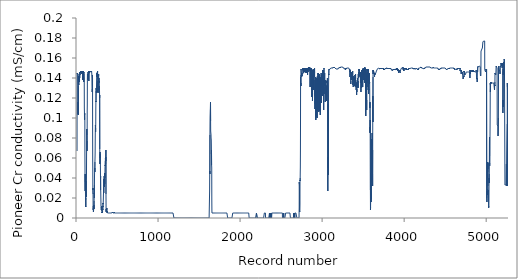
| Category | Series 0 |
|---|---|
| 0.0 | 0.067 |
| 1.0 | 0.145 |
| 2.0 | 0.145 |
| 3.0 | 0.145 |
| 4.0 | 0.144 |
| 5.0 | 0.145 |
| 6.0 | 0.145 |
| 7.0 | 0.145 |
| 8.0 | 0.144 |
| 9.0 | 0.137 |
| 10.0 | 0.134 |
| 11.0 | 0.133 |
| 12.0 | 0.12 |
| 13.0 | 0.104 |
| 14.0 | 0.116 |
| 15.0 | 0.103 |
| 16.0 | 0.132 |
| 17.0 | 0.14 |
| 18.0 | 0.142 |
| 19.0 | 0.142 |
| 20.0 | 0.133 |
| 21.0 | 0.133 |
| 22.0 | 0.133 |
| 23.0 | 0.134 |
| 24.0 | 0.138 |
| 25.0 | 0.139 |
| 26.0 | 0.144 |
| 27.0 | 0.144 |
| 28.0 | 0.136 |
| 29.0 | 0.141 |
| 30.0 | 0.144 |
| 31.0 | 0.143 |
| 32.0 | 0.14 |
| 33.0 | 0.143 |
| 34.0 | 0.145 |
| 35.0 | 0.143 |
| 36.0 | 0.146 |
| 37.0 | 0.145 |
| 38.0 | 0.145 |
| 39.0 | 0.146 |
| 40.0 | 0.146 |
| 41.0 | 0.145 |
| 42.0 | 0.146 |
| 43.0 | 0.146 |
| 44.0 | 0.147 |
| 45.0 | 0.147 |
| 46.0 | 0.147 |
| 47.0 | 0.147 |
| 48.0 | 0.147 |
| 49.0 | 0.147 |
| 50.0 | 0.147 |
| 51.0 | 0.147 |
| 52.0 | 0.146 |
| 53.0 | 0.147 |
| 54.0 | 0.146 |
| 55.0 | 0.147 |
| 56.0 | 0.146 |
| 57.0 | 0.147 |
| 58.0 | 0.147 |
| 59.0 | 0.144 |
| 60.0 | 0.146 |
| 61.0 | 0.145 |
| 62.0 | 0.146 |
| 63.0 | 0.146 |
| 64.0 | 0.146 |
| 65.0 | 0.146 |
| 66.0 | 0.146 |
| 67.0 | 0.145 |
| 68.0 | 0.146 |
| 69.0 | 0.138 |
| 70.0 | 0.146 |
| 71.0 | 0.141 |
| 72.0 | 0.147 |
| 73.0 | 0.138 |
| 74.0 | 0.147 |
| 75.0 | 0.145 |
| 76.0 | 0.146 |
| 77.0 | 0.147 |
| 78.0 | 0.144 |
| 79.0 | 0.142 |
| 80.0 | 0.144 |
| 81.0 | 0.136 |
| 82.0 | 0.146 |
| 83.0 | 0.146 |
| 84.0 | 0.145 |
| 85.0 | 0.143 |
| 86.0 | 0.141 |
| 87.0 | 0.14 |
| 88.0 | 0.135 |
| 89.0 | 0.11 |
| 90.0 | 0.106 |
| 91.0 | 0.098 |
| 92.0 | 0.1 |
| 93.0 | 0.105 |
| 94.0 | 0.103 |
| 95.0 | 0.1 |
| 96.0 | 0.063 |
| 97.0 | 0.05 |
| 98.0 | 0.031 |
| 99.0 | 0.027 |
| 100.0 | 0.044 |
| 101.0 | 0.036 |
| 102.0 | 0.03 |
| 103.0 | 0.024 |
| 104.0 | 0.018 |
| 105.0 | 0.02 |
| 106.0 | 0.011 |
| 107.0 | 0.012 |
| 108.0 | 0.014 |
| 109.0 | 0.032 |
| 110.0 | 0.037 |
| 111.0 | 0.021 |
| 112.0 | 0.026 |
| 113.0 | 0.03 |
| 114.0 | 0.03 |
| 115.0 | 0.04 |
| 116.0 | 0.059 |
| 117.0 | 0.072 |
| 118.0 | 0.086 |
| 119.0 | 0.089 |
| 120.0 | 0.083 |
| 121.0 | 0.081 |
| 122.0 | 0.067 |
| 123.0 | 0.077 |
| 124.0 | 0.107 |
| 125.0 | 0.113 |
| 126.0 | 0.139 |
| 127.0 | 0.144 |
| 128.0 | 0.143 |
| 129.0 | 0.144 |
| 130.0 | 0.144 |
| 131.0 | 0.138 |
| 132.0 | 0.141 |
| 133.0 | 0.142 |
| 134.0 | 0.139 |
| 135.0 | 0.144 |
| 136.0 | 0.146 |
| 137.0 | 0.141 |
| 138.0 | 0.146 |
| 139.0 | 0.142 |
| 140.0 | 0.144 |
| 141.0 | 0.145 |
| 142.0 | 0.146 |
| 143.0 | 0.144 |
| 144.0 | 0.137 |
| 145.0 | 0.147 |
| 146.0 | 0.146 |
| 147.0 | 0.147 |
| 148.0 | 0.147 |
| 149.0 | 0.146 |
| 150.0 | 0.146 |
| 151.0 | 0.147 |
| 152.0 | 0.146 |
| 153.0 | 0.145 |
| 154.0 | 0.147 |
| 155.0 | 0.146 |
| 156.0 | 0.147 |
| 157.0 | 0.147 |
| 158.0 | 0.147 |
| 159.0 | 0.146 |
| 160.0 | 0.147 |
| 161.0 | 0.147 |
| 162.0 | 0.147 |
| 163.0 | 0.147 |
| 164.0 | 0.147 |
| 165.0 | 0.147 |
| 166.0 | 0.147 |
| 167.0 | 0.147 |
| 168.0 | 0.146 |
| 169.0 | 0.147 |
| 170.0 | 0.147 |
| 171.0 | 0.146 |
| 172.0 | 0.147 |
| 173.0 | 0.146 |
| 174.0 | 0.147 |
| 175.0 | 0.146 |
| 176.0 | 0.147 |
| 177.0 | 0.147 |
| 178.0 | 0.146 |
| 179.0 | 0.145 |
| 180.0 | 0.144 |
| 181.0 | 0.143 |
| 182.0 | 0.141 |
| 183.0 | 0.137 |
| 184.0 | 0.137 |
| 185.0 | 0.126 |
| 186.0 | 0.129 |
| 187.0 | 0.143 |
| 188.0 | 0.143 |
| 189.0 | 0.139 |
| 190.0 | 0.085 |
| 191.0 | 0.057 |
| 192.0 | 0.05 |
| 193.0 | 0.028 |
| 194.0 | 0.03 |
| 195.0 | 0.024 |
| 196.0 | 0.011 |
| 197.0 | 0.008 |
| 198.0 | 0.01 |
| 199.0 | 0.012 |
| 200.0 | 0.006 |
| 201.0 | 0.007 |
| 202.0 | 0.008 |
| 203.0 | 0.009 |
| 204.0 | 0.01 |
| 205.0 | 0.011 |
| 206.0 | 0.013 |
| 207.0 | 0.009 |
| 208.0 | 0.017 |
| 209.0 | 0.025 |
| 210.0 | 0.024 |
| 211.0 | 0.02 |
| 212.0 | 0.033 |
| 213.0 | 0.042 |
| 214.0 | 0.047 |
| 215.0 | 0.049 |
| 216.0 | 0.05 |
| 217.0 | 0.046 |
| 218.0 | 0.056 |
| 219.0 | 0.056 |
| 220.0 | 0.062 |
| 221.0 | 0.067 |
| 222.0 | 0.081 |
| 223.0 | 0.089 |
| 224.0 | 0.093 |
| 225.0 | 0.092 |
| 226.0 | 0.086 |
| 227.0 | 0.09 |
| 228.0 | 0.094 |
| 229.0 | 0.109 |
| 230.0 | 0.117 |
| 231.0 | 0.116 |
| 232.0 | 0.127 |
| 233.0 | 0.13 |
| 234.0 | 0.128 |
| 235.0 | 0.128 |
| 236.0 | 0.125 |
| 237.0 | 0.13 |
| 238.0 | 0.13 |
| 239.0 | 0.139 |
| 240.0 | 0.139 |
| 241.0 | 0.145 |
| 242.0 | 0.144 |
| 243.0 | 0.141 |
| 244.0 | 0.145 |
| 245.0 | 0.141 |
| 246.0 | 0.145 |
| 247.0 | 0.145 |
| 248.0 | 0.146 |
| 249.0 | 0.143 |
| 250.0 | 0.147 |
| 251.0 | 0.139 |
| 252.0 | 0.126 |
| 253.0 | 0.131 |
| 254.0 | 0.137 |
| 255.0 | 0.136 |
| 256.0 | 0.125 |
| 257.0 | 0.137 |
| 258.0 | 0.14 |
| 259.0 | 0.14 |
| 260.0 | 0.141 |
| 261.0 | 0.142 |
| 262.0 | 0.143 |
| 263.0 | 0.144 |
| 264.0 | 0.142 |
| 265.0 | 0.136 |
| 266.0 | 0.14 |
| 267.0 | 0.135 |
| 268.0 | 0.137 |
| 269.0 | 0.128 |
| 270.0 | 0.132 |
| 271.0 | 0.132 |
| 272.0 | 0.132 |
| 273.0 | 0.128 |
| 274.0 | 0.127 |
| 275.0 | 0.12 |
| 276.0 | 0.123 |
| 277.0 | 0.069 |
| 278.0 | 0.06 |
| 279.0 | 0.054 |
| 280.0 | 0.061 |
| 281.0 | 0.066 |
| 282.0 | 0.06 |
| 283.0 | 0.064 |
| 284.0 | 0.061 |
| 285.0 | 0.052 |
| 286.0 | 0.039 |
| 287.0 | 0.042 |
| 288.0 | 0.028 |
| 289.0 | 0.027 |
| 290.0 | 0.021 |
| 291.0 | 0.018 |
| 292.0 | 0.012 |
| 293.0 | 0.012 |
| 294.0 | 0.011 |
| 295.0 | 0.01 |
| 296.0 | 0.008 |
| 297.0 | 0.011 |
| 298.0 | 0.01 |
| 299.0 | 0.011 |
| 300.0 | 0.01 |
| 301.0 | 0.012 |
| 302.0 | 0.007 |
| 303.0 | 0.006 |
| 304.0 | 0.005 |
| 305.0 | 0.006 |
| 306.0 | 0.005 |
| 307.0 | 0.006 |
| 308.0 | 0.006 |
| 309.0 | 0.006 |
| 310.0 | 0.005 |
| 311.0 | 0.007 |
| 312.0 | 0.008 |
| 313.0 | 0.009 |
| 314.0 | 0.008 |
| 315.0 | 0.012 |
| 316.0 | 0.011 |
| 317.0 | 0.015 |
| 318.0 | 0.014 |
| 319.0 | 0.015 |
| 320.0 | 0.017 |
| 321.0 | 0.017 |
| 322.0 | 0.024 |
| 323.0 | 0.025 |
| 324.0 | 0.031 |
| 325.0 | 0.025 |
| 326.0 | 0.039 |
| 327.0 | 0.035 |
| 328.0 | 0.032 |
| 329.0 | 0.033 |
| 330.0 | 0.037 |
| 331.0 | 0.042 |
| 332.0 | 0.036 |
| 333.0 | 0.031 |
| 334.0 | 0.036 |
| 335.0 | 0.035 |
| 336.0 | 0.039 |
| 337.0 | 0.034 |
| 338.0 | 0.045 |
| 339.0 | 0.04 |
| 340.0 | 0.042 |
| 341.0 | 0.05 |
| 342.0 | 0.05 |
| 343.0 | 0.053 |
| 344.0 | 0.052 |
| 345.0 | 0.057 |
| 346.0 | 0.06 |
| 347.0 | 0.059 |
| 348.0 | 0.054 |
| 349.0 | 0.061 |
| 350.0 | 0.057 |
| 351.0 | 0.061 |
| 352.0 | 0.068 |
| 353.0 | 0.024 |
| 354.0 | 0.01 |
| 355.0 | 0.006 |
| 356.0 | 0.009 |
| 357.0 | 0.009 |
| 358.0 | 0.007 |
| 359.0 | 0.009 |
| 360.0 | 0.008 |
| 361.0 | 0.008 |
| 362.0 | 0.008 |
| 363.0 | 0.01 |
| 364.0 | 0.006 |
| 365.0 | 0.007 |
| 366.0 | 0.007 |
| 367.0 | 0.005 |
| 368.0 | 0.005 |
| 369.0 | 0.005 |
| 370.0 | 0.006 |
| 371.0 | 0.006 |
| 372.0 | 0.005 |
| 373.0 | 0.005 |
| 374.0 | 0.005 |
| 375.0 | 0.005 |
| 376.0 | 0.005 |
| 377.0 | 0.005 |
| 378.0 | 0.005 |
| 379.0 | 0.005 |
| 380.0 | 0.005 |
| 381.0 | 0.005 |
| 382.0 | 0.005 |
| 383.0 | 0.005 |
| 384.0 | 0.005 |
| 385.0 | 0.005 |
| 386.0 | 0.005 |
| 387.0 | 0.005 |
| 388.0 | 0.005 |
| 389.0 | 0.005 |
| 390.0 | 0.005 |
| 391.0 | 0.005 |
| 392.0 | 0.005 |
| 393.0 | 0.005 |
| 394.0 | 0.005 |
| 395.0 | 0.005 |
| 396.0 | 0.005 |
| 397.0 | 0.005 |
| 398.0 | 0.005 |
| 399.0 | 0.005 |
| 400.0 | 0.005 |
| 401.0 | 0.005 |
| 402.0 | 0.005 |
| 403.0 | 0.005 |
| 404.0 | 0.005 |
| 405.0 | 0.005 |
| 406.0 | 0.005 |
| 407.0 | 0.005 |
| 408.0 | 0.005 |
| 409.0 | 0.005 |
| 410.0 | 0.005 |
| 411.0 | 0.005 |
| 412.0 | 0.005 |
| 413.0 | 0.005 |
| 414.0 | 0.005 |
| 415.0 | 0.005 |
| 416.0 | 0.005 |
| 417.0 | 0.005 |
| 418.0 | 0.005 |
| 419.0 | 0.005 |
| 420.0 | 0.005 |
| 421.0 | 0.005 |
| 422.0 | 0.005 |
| 423.0 | 0.005 |
| 424.0 | 0.005 |
| 425.0 | 0.005 |
| 426.0 | 0.005 |
| 427.0 | 0.005 |
| 428.0 | 0.005 |
| 429.0 | 0.005 |
| 430.0 | 0.005 |
| 431.0 | 0.006 |
| 432.0 | 0.005 |
| 433.0 | 0.005 |
| 434.0 | 0.005 |
| 435.0 | 0.005 |
| 436.0 | 0.005 |
| 437.0 | 0.005 |
| 438.0 | 0.005 |
| 439.0 | 0.006 |
| 440.0 | 0.005 |
| 441.0 | 0.005 |
| 442.0 | 0.005 |
| 443.0 | 0.005 |
| 444.0 | 0.005 |
| 445.0 | 0.005 |
| 446.0 | 0.005 |
| 447.0 | 0.005 |
| 448.0 | 0.005 |
| 449.0 | 0.005 |
| 450.0 | 0.005 |
| 451.0 | 0.005 |
| 452.0 | 0.005 |
| 453.0 | 0.005 |
| 454.0 | 0.006 |
| 455.0 | 0.005 |
| 456.0 | 0.005 |
| 457.0 | 0.005 |
| 458.0 | 0.005 |
| 459.0 | 0.005 |
| 460.0 | 0.005 |
| 461.0 | 0.005 |
| 462.0 | 0.005 |
| 463.0 | 0.005 |
| 464.0 | 0.005 |
| 465.0 | 0.005 |
| 466.0 | 0.005 |
| 467.0 | 0.005 |
| 468.0 | 0.005 |
| 469.0 | 0.005 |
| 470.0 | 0.005 |
| 471.0 | 0.005 |
| 472.0 | 0.005 |
| 473.0 | 0.005 |
| 474.0 | 0.005 |
| 475.0 | 0.005 |
| 476.0 | 0.005 |
| 477.0 | 0.005 |
| 478.0 | 0.005 |
| 479.0 | 0.005 |
| 480.0 | 0.005 |
| 481.0 | 0.005 |
| 482.0 | 0.005 |
| 483.0 | 0.005 |
| 484.0 | 0.005 |
| 485.0 | 0.005 |
| 486.0 | 0.005 |
| 487.0 | 0.005 |
| 488.0 | 0.005 |
| 489.0 | 0.005 |
| 490.0 | 0.005 |
| 491.0 | 0.005 |
| 492.0 | 0.005 |
| 493.0 | 0.005 |
| 494.0 | 0.005 |
| 495.0 | 0.005 |
| 496.0 | 0.005 |
| 497.0 | 0.005 |
| 498.0 | 0.005 |
| 499.0 | 0.005 |
| 500.0 | 0.005 |
| 501.0 | 0.005 |
| 502.0 | 0.005 |
| 503.0 | 0.005 |
| 504.0 | 0.005 |
| 505.0 | 0.005 |
| 506.0 | 0.005 |
| 507.0 | 0.005 |
| 508.0 | 0.005 |
| 509.0 | 0.005 |
| 510.0 | 0.005 |
| 511.0 | 0.005 |
| 512.0 | 0.005 |
| 513.0 | 0.005 |
| 514.0 | 0.005 |
| 515.0 | 0.005 |
| 516.0 | 0.005 |
| 517.0 | 0.005 |
| 518.0 | 0.005 |
| 519.0 | 0.005 |
| 520.0 | 0.005 |
| 521.0 | 0.005 |
| 522.0 | 0.005 |
| 523.0 | 0.005 |
| 524.0 | 0.005 |
| 525.0 | 0.005 |
| 526.0 | 0.005 |
| 527.0 | 0.005 |
| 528.0 | 0.005 |
| 529.0 | 0.005 |
| 530.0 | 0.005 |
| 531.0 | 0.005 |
| 532.0 | 0.005 |
| 533.0 | 0.005 |
| 534.0 | 0.005 |
| 535.0 | 0.005 |
| 536.0 | 0.005 |
| 537.0 | 0.005 |
| 538.0 | 0.005 |
| 539.0 | 0.005 |
| 540.0 | 0.005 |
| 541.0 | 0.005 |
| 542.0 | 0.005 |
| 543.0 | 0.005 |
| 544.0 | 0.005 |
| 545.0 | 0.005 |
| 546.0 | 0.005 |
| 547.0 | 0.005 |
| 548.0 | 0.005 |
| 549.0 | 0.005 |
| 550.0 | 0.005 |
| 551.0 | 0.005 |
| 552.0 | 0.005 |
| 553.0 | 0.005 |
| 554.0 | 0.005 |
| 555.0 | 0.005 |
| 556.0 | 0.005 |
| 557.0 | 0.005 |
| 558.0 | 0.005 |
| 559.0 | 0.005 |
| 560.0 | 0.005 |
| 561.0 | 0.005 |
| 562.0 | 0.005 |
| 563.0 | 0.005 |
| 564.0 | 0.005 |
| 565.0 | 0.005 |
| 566.0 | 0.005 |
| 567.0 | 0.005 |
| 568.0 | 0.005 |
| 569.0 | 0.005 |
| 570.0 | 0.005 |
| 571.0 | 0.005 |
| 572.0 | 0.005 |
| 573.0 | 0.005 |
| 574.0 | 0.005 |
| 575.0 | 0.005 |
| 576.0 | 0.005 |
| 577.0 | 0.005 |
| 578.0 | 0.005 |
| 579.0 | 0.005 |
| 580.0 | 0.005 |
| 581.0 | 0.005 |
| 582.0 | 0.005 |
| 583.0 | 0.005 |
| 584.0 | 0.005 |
| 585.0 | 0.005 |
| 586.0 | 0.005 |
| 587.0 | 0.005 |
| 588.0 | 0.005 |
| 589.0 | 0.005 |
| 590.0 | 0.005 |
| 591.0 | 0.005 |
| 592.0 | 0.005 |
| 593.0 | 0.005 |
| 594.0 | 0.005 |
| 595.0 | 0.005 |
| 596.0 | 0.005 |
| 597.0 | 0.005 |
| 598.0 | 0.005 |
| 599.0 | 0.005 |
| 600.0 | 0.005 |
| 601.0 | 0.005 |
| 602.0 | 0.005 |
| 603.0 | 0.005 |
| 604.0 | 0.005 |
| 605.0 | 0.005 |
| 606.0 | 0.005 |
| 607.0 | 0.005 |
| 608.0 | 0.005 |
| 609.0 | 0.005 |
| 610.0 | 0.005 |
| 611.0 | 0.005 |
| 612.0 | 0.005 |
| 613.0 | 0.005 |
| 614.0 | 0.005 |
| 615.0 | 0.005 |
| 616.0 | 0.005 |
| 617.0 | 0.005 |
| 618.0 | 0.005 |
| 619.0 | 0.005 |
| 620.0 | 0.005 |
| 621.0 | 0.005 |
| 622.0 | 0.005 |
| 623.0 | 0.005 |
| 624.0 | 0.005 |
| 625.0 | 0.005 |
| 626.0 | 0.005 |
| 627.0 | 0.005 |
| 628.0 | 0.005 |
| 629.0 | 0.005 |
| 630.0 | 0.005 |
| 631.0 | 0.005 |
| 632.0 | 0.005 |
| 633.0 | 0.005 |
| 634.0 | 0.005 |
| 635.0 | 0.005 |
| 636.0 | 0.005 |
| 637.0 | 0.005 |
| 638.0 | 0.005 |
| 639.0 | 0.005 |
| 640.0 | 0.005 |
| 641.0 | 0.005 |
| 642.0 | 0.005 |
| 643.0 | 0.005 |
| 644.0 | 0.005 |
| 645.0 | 0.005 |
| 646.0 | 0.005 |
| 647.0 | 0.005 |
| 648.0 | 0.005 |
| 649.0 | 0.005 |
| 650.0 | 0.005 |
| 651.0 | 0.005 |
| 652.0 | 0.005 |
| 653.0 | 0.005 |
| 654.0 | 0.005 |
| 655.0 | 0.005 |
| 656.0 | 0.005 |
| 657.0 | 0.005 |
| 658.0 | 0.005 |
| 659.0 | 0.005 |
| 660.0 | 0.005 |
| 661.0 | 0.005 |
| 662.0 | 0.005 |
| 663.0 | 0.005 |
| 664.0 | 0.005 |
| 665.0 | 0.005 |
| 666.0 | 0.005 |
| 667.0 | 0.005 |
| 668.0 | 0.005 |
| 669.0 | 0.005 |
| 670.0 | 0.005 |
| 671.0 | 0.005 |
| 672.0 | 0.005 |
| 673.0 | 0.005 |
| 674.0 | 0.005 |
| 675.0 | 0.005 |
| 676.0 | 0.005 |
| 677.0 | 0.005 |
| 678.0 | 0.005 |
| 679.0 | 0.005 |
| 680.0 | 0.005 |
| 681.0 | 0.005 |
| 682.0 | 0.005 |
| 683.0 | 0.005 |
| 684.0 | 0.005 |
| 685.0 | 0.005 |
| 686.0 | 0.005 |
| 687.0 | 0.005 |
| 688.0 | 0.005 |
| 689.0 | 0.005 |
| 690.0 | 0.005 |
| 691.0 | 0.005 |
| 692.0 | 0.005 |
| 693.0 | 0.005 |
| 694.0 | 0.005 |
| 695.0 | 0.005 |
| 696.0 | 0.005 |
| 697.0 | 0.005 |
| 698.0 | 0.005 |
| 699.0 | 0.005 |
| 700.0 | 0.005 |
| 701.0 | 0.005 |
| 702.0 | 0.005 |
| 703.0 | 0.005 |
| 704.0 | 0.005 |
| 705.0 | 0.005 |
| 706.0 | 0.005 |
| 707.0 | 0.005 |
| 708.0 | 0.005 |
| 709.0 | 0.005 |
| 710.0 | 0.005 |
| 711.0 | 0.005 |
| 712.0 | 0.005 |
| 713.0 | 0.005 |
| 714.0 | 0.005 |
| 715.0 | 0.005 |
| 716.0 | 0.005 |
| 717.0 | 0.005 |
| 718.0 | 0.005 |
| 719.0 | 0.005 |
| 720.0 | 0.005 |
| 721.0 | 0.005 |
| 722.0 | 0.005 |
| 723.0 | 0.005 |
| 724.0 | 0.005 |
| 725.0 | 0.005 |
| 726.0 | 0.005 |
| 727.0 | 0.005 |
| 728.0 | 0.005 |
| 729.0 | 0.005 |
| 730.0 | 0.005 |
| 731.0 | 0.005 |
| 732.0 | 0.005 |
| 733.0 | 0.005 |
| 734.0 | 0.005 |
| 735.0 | 0.005 |
| 736.0 | 0.005 |
| 737.0 | 0.005 |
| 738.0 | 0.005 |
| 739.0 | 0.005 |
| 740.0 | 0.005 |
| 741.0 | 0.005 |
| 742.0 | 0.005 |
| 743.0 | 0.005 |
| 744.0 | 0.005 |
| 745.0 | 0.005 |
| 746.0 | 0.005 |
| 747.0 | 0.005 |
| 748.0 | 0.005 |
| 749.0 | 0.005 |
| 750.0 | 0.005 |
| 751.0 | 0.005 |
| 752.0 | 0.005 |
| 753.0 | 0.005 |
| 754.0 | 0.005 |
| 755.0 | 0.005 |
| 756.0 | 0.005 |
| 757.0 | 0.005 |
| 758.0 | 0.005 |
| 759.0 | 0.005 |
| 760.0 | 0.005 |
| 761.0 | 0.005 |
| 762.0 | 0.005 |
| 763.0 | 0.005 |
| 764.0 | 0.005 |
| 765.0 | 0.005 |
| 766.0 | 0.005 |
| 767.0 | 0.005 |
| 768.0 | 0.005 |
| 769.0 | 0.005 |
| 770.0 | 0.005 |
| 771.0 | 0.005 |
| 772.0 | 0.005 |
| 773.0 | 0.005 |
| 774.0 | 0.005 |
| 775.0 | 0.005 |
| 776.0 | 0.005 |
| 777.0 | 0.005 |
| 778.0 | 0.005 |
| 779.0 | 0.005 |
| 780.0 | 0.005 |
| 781.0 | 0.005 |
| 782.0 | 0.005 |
| 783.0 | 0.005 |
| 784.0 | 0.005 |
| 785.0 | 0.005 |
| 786.0 | 0.005 |
| 787.0 | 0.005 |
| 788.0 | 0.005 |
| 789.0 | 0.005 |
| 790.0 | 0.005 |
| 791.0 | 0.005 |
| 792.0 | 0.005 |
| 793.0 | 0.005 |
| 794.0 | 0.005 |
| 795.0 | 0.005 |
| 796.0 | 0.005 |
| 797.0 | 0.005 |
| 798.0 | 0.005 |
| 799.0 | 0.005 |
| 800.0 | 0.005 |
| 801.0 | 0.005 |
| 802.0 | 0.005 |
| 803.0 | 0.005 |
| 804.0 | 0.005 |
| 805.0 | 0.005 |
| 806.0 | 0.005 |
| 807.0 | 0.005 |
| 808.0 | 0.005 |
| 809.0 | 0.005 |
| 810.0 | 0.005 |
| 811.0 | 0.005 |
| 812.0 | 0.005 |
| 813.0 | 0.005 |
| 814.0 | 0.005 |
| 815.0 | 0.005 |
| 816.0 | 0.005 |
| 817.0 | 0.005 |
| 818.0 | 0.005 |
| 819.0 | 0.005 |
| 820.0 | 0.005 |
| 821.0 | 0.005 |
| 822.0 | 0.005 |
| 823.0 | 0.005 |
| 824.0 | 0.005 |
| 825.0 | 0.005 |
| 826.0 | 0.005 |
| 827.0 | 0.005 |
| 828.0 | 0.005 |
| 829.0 | 0.005 |
| 830.0 | 0.005 |
| 831.0 | 0.005 |
| 832.0 | 0.005 |
| 833.0 | 0.005 |
| 834.0 | 0.005 |
| 835.0 | 0.005 |
| 836.0 | 0.005 |
| 837.0 | 0.005 |
| 838.0 | 0.005 |
| 839.0 | 0.005 |
| 840.0 | 0.005 |
| 841.0 | 0.005 |
| 842.0 | 0.005 |
| 843.0 | 0.005 |
| 844.0 | 0.005 |
| 845.0 | 0.005 |
| 846.0 | 0.005 |
| 847.0 | 0.005 |
| 848.0 | 0.005 |
| 849.0 | 0.005 |
| 850.0 | 0.005 |
| 851.0 | 0.005 |
| 852.0 | 0.005 |
| 853.0 | 0.005 |
| 854.0 | 0.005 |
| 855.0 | 0.005 |
| 856.0 | 0.005 |
| 857.0 | 0.005 |
| 858.0 | 0.005 |
| 859.0 | 0.005 |
| 860.0 | 0.005 |
| 861.0 | 0.005 |
| 862.0 | 0.005 |
| 863.0 | 0.005 |
| 864.0 | 0.005 |
| 865.0 | 0.005 |
| 866.0 | 0.005 |
| 867.0 | 0.005 |
| 868.0 | 0.005 |
| 869.0 | 0.005 |
| 870.0 | 0.005 |
| 871.0 | 0.005 |
| 872.0 | 0.005 |
| 873.0 | 0.005 |
| 874.0 | 0.005 |
| 875.0 | 0.005 |
| 876.0 | 0.005 |
| 877.0 | 0.005 |
| 878.0 | 0.005 |
| 879.0 | 0.005 |
| 880.0 | 0.005 |
| 881.0 | 0.005 |
| 882.0 | 0.005 |
| 883.0 | 0.005 |
| 884.0 | 0.005 |
| 885.0 | 0.005 |
| 886.0 | 0.005 |
| 887.0 | 0.005 |
| 888.0 | 0.005 |
| 889.0 | 0.005 |
| 890.0 | 0.005 |
| 891.0 | 0.005 |
| 892.0 | 0.005 |
| 893.0 | 0.005 |
| 894.0 | 0.005 |
| 895.0 | 0.005 |
| 896.0 | 0.005 |
| 897.0 | 0.005 |
| 898.0 | 0.005 |
| 899.0 | 0.005 |
| 900.0 | 0.005 |
| 901.0 | 0.005 |
| 902.0 | 0.005 |
| 903.0 | 0.005 |
| 904.0 | 0.005 |
| 905.0 | 0.005 |
| 906.0 | 0.005 |
| 907.0 | 0.005 |
| 908.0 | 0.005 |
| 909.0 | 0.005 |
| 910.0 | 0.005 |
| 911.0 | 0.005 |
| 912.0 | 0.005 |
| 913.0 | 0.005 |
| 914.0 | 0.005 |
| 915.0 | 0.005 |
| 916.0 | 0.005 |
| 917.0 | 0.005 |
| 918.0 | 0.005 |
| 919.0 | 0.005 |
| 920.0 | 0.005 |
| 921.0 | 0.005 |
| 922.0 | 0.005 |
| 923.0 | 0.005 |
| 924.0 | 0.005 |
| 925.0 | 0.005 |
| 926.0 | 0.005 |
| 927.0 | 0.005 |
| 928.0 | 0.005 |
| 929.0 | 0.005 |
| 930.0 | 0.005 |
| 931.0 | 0.005 |
| 932.0 | 0.005 |
| 933.0 | 0.005 |
| 934.0 | 0.005 |
| 935.0 | 0.005 |
| 936.0 | 0.005 |
| 937.0 | 0.005 |
| 938.0 | 0.005 |
| 939.0 | 0.005 |
| 940.0 | 0.005 |
| 941.0 | 0.005 |
| 942.0 | 0.005 |
| 943.0 | 0.005 |
| 944.0 | 0.005 |
| 945.0 | 0.005 |
| 946.0 | 0.005 |
| 947.0 | 0.005 |
| 948.0 | 0.005 |
| 949.0 | 0.005 |
| 950.0 | 0.005 |
| 951.0 | 0.005 |
| 952.0 | 0.005 |
| 953.0 | 0.005 |
| 954.0 | 0.005 |
| 955.0 | 0.005 |
| 956.0 | 0.005 |
| 957.0 | 0.005 |
| 958.0 | 0.005 |
| 959.0 | 0.005 |
| 960.0 | 0.005 |
| 961.0 | 0.005 |
| 962.0 | 0.005 |
| 963.0 | 0.005 |
| 964.0 | 0.005 |
| 965.0 | 0.005 |
| 966.0 | 0.005 |
| 967.0 | 0.005 |
| 968.0 | 0.005 |
| 969.0 | 0.005 |
| 970.0 | 0.005 |
| 971.0 | 0.005 |
| 972.0 | 0.005 |
| 973.0 | 0.005 |
| 974.0 | 0.005 |
| 975.0 | 0.005 |
| 976.0 | 0.005 |
| 977.0 | 0.005 |
| 978.0 | 0.005 |
| 979.0 | 0.005 |
| 980.0 | 0.005 |
| 981.0 | 0.005 |
| 982.0 | 0.005 |
| 983.0 | 0.005 |
| 984.0 | 0.005 |
| 985.0 | 0.005 |
| 986.0 | 0.005 |
| 987.0 | 0.005 |
| 988.0 | 0.005 |
| 989.0 | 0.005 |
| 990.0 | 0.005 |
| 991.0 | 0.005 |
| 992.0 | 0.005 |
| 993.0 | 0.005 |
| 994.0 | 0.005 |
| 995.0 | 0.005 |
| 996.0 | 0.005 |
| 997.0 | 0.005 |
| 998.0 | 0.005 |
| 999.0 | 0.005 |
| 1000.0 | 0.005 |
| 1001.0 | 0.005 |
| 1002.0 | 0.005 |
| 1003.0 | 0.005 |
| 1004.0 | 0.005 |
| 1005.0 | 0.005 |
| 1006.0 | 0.005 |
| 1007.0 | 0.005 |
| 1008.0 | 0.005 |
| 1009.0 | 0.005 |
| 1010.0 | 0.005 |
| 1011.0 | 0.005 |
| 1012.0 | 0.005 |
| 1013.0 | 0.005 |
| 1014.0 | 0.005 |
| 1015.0 | 0.005 |
| 1016.0 | 0.005 |
| 1017.0 | 0.005 |
| 1018.0 | 0.005 |
| 1019.0 | 0.005 |
| 1020.0 | 0.005 |
| 1021.0 | 0.005 |
| 1022.0 | 0.005 |
| 1023.0 | 0.005 |
| 1024.0 | 0.005 |
| 1025.0 | 0.005 |
| 1026.0 | 0.005 |
| 1027.0 | 0.005 |
| 1028.0 | 0.005 |
| 1029.0 | 0.005 |
| 1030.0 | 0.005 |
| 1031.0 | 0.005 |
| 1032.0 | 0.005 |
| 1033.0 | 0.005 |
| 1034.0 | 0.005 |
| 1035.0 | 0.005 |
| 1036.0 | 0.005 |
| 1037.0 | 0.005 |
| 1038.0 | 0.005 |
| 1039.0 | 0.005 |
| 1040.0 | 0.005 |
| 1041.0 | 0.005 |
| 1042.0 | 0.005 |
| 1043.0 | 0.005 |
| 1044.0 | 0.005 |
| 1045.0 | 0.005 |
| 1046.0 | 0.005 |
| 1047.0 | 0.005 |
| 1048.0 | 0.005 |
| 1049.0 | 0.005 |
| 1050.0 | 0.005 |
| 1051.0 | 0.005 |
| 1052.0 | 0.005 |
| 1053.0 | 0.005 |
| 1054.0 | 0.005 |
| 1055.0 | 0.005 |
| 1056.0 | 0.005 |
| 1057.0 | 0.005 |
| 1058.0 | 0.005 |
| 1059.0 | 0.005 |
| 1060.0 | 0.005 |
| 1061.0 | 0.005 |
| 1062.0 | 0.005 |
| 1063.0 | 0.005 |
| 1064.0 | 0.005 |
| 1065.0 | 0.005 |
| 1066.0 | 0.005 |
| 1067.0 | 0.005 |
| 1068.0 | 0.005 |
| 1069.0 | 0.005 |
| 1070.0 | 0.005 |
| 1071.0 | 0.005 |
| 1072.0 | 0.005 |
| 1073.0 | 0.005 |
| 1074.0 | 0.005 |
| 1075.0 | 0.005 |
| 1076.0 | 0.005 |
| 1077.0 | 0.005 |
| 1078.0 | 0.005 |
| 1079.0 | 0.005 |
| 1080.0 | 0.005 |
| 1081.0 | 0.005 |
| 1082.0 | 0.005 |
| 1083.0 | 0.005 |
| 1084.0 | 0.005 |
| 1085.0 | 0.005 |
| 1086.0 | 0.005 |
| 1087.0 | 0.005 |
| 1088.0 | 0.005 |
| 1089.0 | 0.005 |
| 1090.0 | 0.005 |
| 1091.0 | 0.005 |
| 1092.0 | 0.005 |
| 1093.0 | 0.005 |
| 1094.0 | 0.005 |
| 1095.0 | 0.005 |
| 1096.0 | 0.005 |
| 1097.0 | 0.005 |
| 1098.0 | 0.005 |
| 1099.0 | 0.005 |
| 1100.0 | 0.005 |
| 1101.0 | 0.005 |
| 1102.0 | 0.005 |
| 1103.0 | 0.005 |
| 1104.0 | 0.005 |
| 1105.0 | 0.005 |
| 1106.0 | 0.005 |
| 1107.0 | 0.005 |
| 1108.0 | 0.005 |
| 1109.0 | 0.005 |
| 1110.0 | 0.005 |
| 1111.0 | 0.005 |
| 1112.0 | 0.005 |
| 1113.0 | 0.005 |
| 1114.0 | 0.005 |
| 1115.0 | 0.005 |
| 1116.0 | 0.005 |
| 1117.0 | 0.005 |
| 1118.0 | 0.005 |
| 1119.0 | 0.005 |
| 1120.0 | 0.005 |
| 1121.0 | 0.005 |
| 1122.0 | 0.005 |
| 1123.0 | 0.005 |
| 1124.0 | 0.005 |
| 1125.0 | 0.005 |
| 1126.0 | 0.005 |
| 1127.0 | 0.005 |
| 1128.0 | 0.005 |
| 1129.0 | 0.005 |
| 1130.0 | 0.005 |
| 1131.0 | 0.005 |
| 1132.0 | 0.005 |
| 1133.0 | 0.005 |
| 1134.0 | 0.005 |
| 1135.0 | 0.005 |
| 1136.0 | 0.005 |
| 1137.0 | 0.005 |
| 1138.0 | 0.005 |
| 1139.0 | 0.005 |
| 1140.0 | 0.005 |
| 1141.0 | 0.005 |
| 1142.0 | 0.005 |
| 1143.0 | 0.005 |
| 1144.0 | 0.005 |
| 1145.0 | 0.005 |
| 1146.0 | 0.005 |
| 1147.0 | 0.005 |
| 1148.0 | 0.005 |
| 1149.0 | 0.005 |
| 1150.0 | 0.005 |
| 1151.0 | 0.005 |
| 1152.0 | 0.005 |
| 1153.0 | 0.005 |
| 1154.0 | 0.005 |
| 1155.0 | 0.005 |
| 1156.0 | 0.005 |
| 1157.0 | 0.005 |
| 1158.0 | 0.005 |
| 1159.0 | 0.005 |
| 1160.0 | 0.005 |
| 1161.0 | 0.005 |
| 1162.0 | 0.005 |
| 1163.0 | 0.005 |
| 1164.0 | 0.005 |
| 1165.0 | 0.005 |
| 1166.0 | 0.005 |
| 1167.0 | 0.005 |
| 1168.0 | 0.005 |
| 1169.0 | 0.005 |
| 1170.0 | 0.005 |
| 1171.0 | 0.005 |
| 1172.0 | 0.005 |
| 1173.0 | 0.005 |
| 1174.0 | 0.005 |
| 1175.0 | 0.005 |
| 1176.0 | 0.005 |
| 1177.0 | 0.005 |
| 1178.0 | 0.005 |
| 1179.0 | 0.005 |
| 1180.0 | 0.005 |
| 1181.0 | 0 |
| 1182.0 | 0 |
| 1183.0 | 0 |
| 1184.0 | 0 |
| 1185.0 | 0 |
| 1186.0 | 0 |
| 1187.0 | 0 |
| 1188.0 | 0 |
| 1189.0 | 0 |
| 1190.0 | 0 |
| 1191.0 | 0 |
| 1192.0 | 0 |
| 1193.0 | 0 |
| 1194.0 | 0 |
| 1195.0 | 0 |
| 1196.0 | 0 |
| 1197.0 | 0 |
| 1198.0 | 0 |
| 1199.0 | 0 |
| 1200.0 | 0 |
| 1201.0 | 0 |
| 1202.0 | 0 |
| 1203.0 | 0 |
| 1204.0 | 0 |
| 1205.0 | 0 |
| 1206.0 | 0 |
| 1207.0 | 0 |
| 1208.0 | 0 |
| 1209.0 | 0 |
| 1210.0 | 0 |
| 1211.0 | 0 |
| 1212.0 | 0 |
| 1213.0 | 0 |
| 1214.0 | 0 |
| 1215.0 | 0 |
| 1216.0 | 0 |
| 1217.0 | 0 |
| 1218.0 | 0 |
| 1219.0 | 0 |
| 1220.0 | 0 |
| 1221.0 | 0 |
| 1222.0 | 0 |
| 1223.0 | 0 |
| 1224.0 | 0 |
| 1225.0 | 0 |
| 1226.0 | 0 |
| 1227.0 | 0 |
| 1228.0 | 0 |
| 1229.0 | 0 |
| 1230.0 | 0 |
| 1231.0 | 0 |
| 1232.0 | 0 |
| 1233.0 | 0 |
| 1234.0 | 0 |
| 1235.0 | 0 |
| 1236.0 | 0 |
| 1237.0 | 0 |
| 1238.0 | 0 |
| 1239.0 | 0 |
| 1240.0 | 0 |
| 1241.0 | 0 |
| 1242.0 | 0 |
| 1243.0 | 0 |
| 1244.0 | 0 |
| 1245.0 | 0 |
| 1246.0 | 0 |
| 1247.0 | 0 |
| 1248.0 | 0 |
| 1249.0 | 0 |
| 1250.0 | 0 |
| 1251.0 | 0 |
| 1252.0 | 0 |
| 1253.0 | 0 |
| 1254.0 | 0 |
| 1255.0 | 0 |
| 1256.0 | 0 |
| 1257.0 | 0 |
| 1258.0 | 0 |
| 1259.0 | 0 |
| 1260.0 | 0 |
| 1261.0 | 0 |
| 1262.0 | 0 |
| 1263.0 | 0 |
| 1264.0 | 0 |
| 1265.0 | 0 |
| 1266.0 | 0 |
| 1267.0 | 0 |
| 1268.0 | 0 |
| 1269.0 | 0 |
| 1270.0 | 0 |
| 1271.0 | 0 |
| 1272.0 | 0 |
| 1273.0 | 0 |
| 1274.0 | 0 |
| 1275.0 | 0 |
| 1276.0 | 0 |
| 1277.0 | 0 |
| 1278.0 | 0 |
| 1279.0 | 0 |
| 1280.0 | 0 |
| 1281.0 | 0 |
| 1282.0 | 0 |
| 1283.0 | 0 |
| 1284.0 | 0 |
| 1285.0 | 0 |
| 1286.0 | 0 |
| 1287.0 | 0 |
| 1288.0 | 0 |
| 1289.0 | 0 |
| 1290.0 | 0 |
| 1291.0 | 0 |
| 1292.0 | 0 |
| 1293.0 | 0 |
| 1294.0 | 0 |
| 1295.0 | 0 |
| 1296.0 | 0 |
| 1297.0 | 0 |
| 1298.0 | 0 |
| 1299.0 | 0 |
| 1300.0 | 0 |
| 1301.0 | 0 |
| 1302.0 | 0 |
| 1303.0 | 0 |
| 1304.0 | 0 |
| 1305.0 | 0 |
| 1306.0 | 0 |
| 1307.0 | 0 |
| 1308.0 | 0 |
| 1309.0 | 0 |
| 1310.0 | 0 |
| 1311.0 | 0 |
| 1312.0 | 0 |
| 1313.0 | 0 |
| 1314.0 | 0 |
| 1315.0 | 0 |
| 1316.0 | 0 |
| 1317.0 | 0 |
| 1318.0 | 0 |
| 1319.0 | 0 |
| 1320.0 | 0 |
| 1321.0 | 0 |
| 1322.0 | 0 |
| 1323.0 | 0 |
| 1324.0 | 0 |
| 1325.0 | 0 |
| 1326.0 | 0 |
| 1327.0 | 0 |
| 1328.0 | 0 |
| 1329.0 | 0 |
| 1330.0 | 0 |
| 1331.0 | 0 |
| 1332.0 | 0 |
| 1333.0 | 0 |
| 1334.0 | 0 |
| 1335.0 | 0 |
| 1336.0 | 0 |
| 1337.0 | 0 |
| 1338.0 | 0 |
| 1339.0 | 0 |
| 1340.0 | 0 |
| 1341.0 | 0 |
| 1342.0 | 0 |
| 1343.0 | 0 |
| 1344.0 | 0 |
| 1345.0 | 0 |
| 1346.0 | 0 |
| 1347.0 | 0 |
| 1348.0 | 0 |
| 1349.0 | 0 |
| 1350.0 | 0 |
| 1351.0 | 0 |
| 1352.0 | 0 |
| 1353.0 | 0 |
| 1354.0 | 0 |
| 1355.0 | 0 |
| 1356.0 | 0 |
| 1357.0 | 0 |
| 1358.0 | 0 |
| 1359.0 | 0 |
| 1360.0 | 0 |
| 1361.0 | 0 |
| 1362.0 | 0 |
| 1363.0 | 0 |
| 1364.0 | 0 |
| 1365.0 | 0 |
| 1366.0 | 0 |
| 1367.0 | 0 |
| 1368.0 | 0 |
| 1369.0 | 0 |
| 1370.0 | 0 |
| 1371.0 | 0 |
| 1372.0 | 0 |
| 1373.0 | 0 |
| 1374.0 | 0 |
| 1375.0 | 0 |
| 1376.0 | 0 |
| 1377.0 | 0 |
| 1378.0 | 0 |
| 1379.0 | 0 |
| 1380.0 | 0 |
| 1381.0 | 0 |
| 1382.0 | 0 |
| 1383.0 | 0 |
| 1384.0 | 0 |
| 1385.0 | 0 |
| 1386.0 | 0 |
| 1387.0 | 0 |
| 1388.0 | 0 |
| 1389.0 | 0 |
| 1390.0 | 0 |
| 1391.0 | 0 |
| 1392.0 | 0 |
| 1393.0 | 0 |
| 1394.0 | 0 |
| 1395.0 | 0 |
| 1396.0 | 0 |
| 1397.0 | 0 |
| 1398.0 | 0 |
| 1399.0 | 0 |
| 1400.0 | 0 |
| 1401.0 | 0 |
| 1402.0 | 0 |
| 1403.0 | 0 |
| 1404.0 | 0 |
| 1405.0 | 0 |
| 1406.0 | 0 |
| 1407.0 | 0 |
| 1408.0 | 0 |
| 1409.0 | 0 |
| 1410.0 | 0 |
| 1411.0 | 0 |
| 1412.0 | 0 |
| 1413.0 | 0 |
| 1414.0 | 0 |
| 1415.0 | 0 |
| 1416.0 | 0 |
| 1417.0 | 0 |
| 1418.0 | 0 |
| 1419.0 | 0 |
| 1420.0 | 0 |
| 1421.0 | 0 |
| 1422.0 | 0 |
| 1423.0 | 0 |
| 1424.0 | 0 |
| 1425.0 | 0 |
| 1426.0 | 0 |
| 1427.0 | 0 |
| 1428.0 | 0 |
| 1429.0 | 0 |
| 1430.0 | 0 |
| 1431.0 | 0 |
| 1432.0 | 0 |
| 1433.0 | 0 |
| 1434.0 | 0 |
| 1435.0 | 0 |
| 1436.0 | 0 |
| 1437.0 | 0 |
| 1438.0 | 0 |
| 1439.0 | 0 |
| 1440.0 | 0 |
| 1441.0 | 0 |
| 1442.0 | 0 |
| 1443.0 | 0 |
| 1444.0 | 0 |
| 1445.0 | 0 |
| 1446.0 | 0 |
| 1447.0 | 0 |
| 1448.0 | 0 |
| 1449.0 | 0 |
| 1450.0 | 0 |
| 1451.0 | 0 |
| 1452.0 | 0 |
| 1453.0 | 0 |
| 1454.0 | 0 |
| 1455.0 | 0 |
| 1456.0 | 0 |
| 1457.0 | 0 |
| 1458.0 | 0 |
| 1459.0 | 0 |
| 1460.0 | 0 |
| 1461.0 | 0 |
| 1462.0 | 0 |
| 1463.0 | 0 |
| 1464.0 | 0 |
| 1465.0 | 0 |
| 1466.0 | 0 |
| 1467.0 | 0 |
| 1468.0 | 0 |
| 1469.0 | 0 |
| 1470.0 | 0 |
| 1471.0 | 0 |
| 1472.0 | 0 |
| 1473.0 | 0 |
| 1474.0 | 0 |
| 1475.0 | 0 |
| 1476.0 | 0 |
| 1477.0 | 0 |
| 1478.0 | 0 |
| 1479.0 | 0 |
| 1480.0 | 0 |
| 1481.0 | 0 |
| 1482.0 | 0 |
| 1483.0 | 0 |
| 1484.0 | 0 |
| 1485.0 | 0 |
| 1486.0 | 0 |
| 1487.0 | 0 |
| 1488.0 | 0 |
| 1489.0 | 0 |
| 1490.0 | 0 |
| 1491.0 | 0 |
| 1492.0 | 0 |
| 1493.0 | 0 |
| 1494.0 | 0 |
| 1495.0 | 0 |
| 1496.0 | 0 |
| 1497.0 | 0 |
| 1498.0 | 0 |
| 1499.0 | 0 |
| 1500.0 | 0 |
| 1501.0 | 0 |
| 1502.0 | 0 |
| 1503.0 | 0 |
| 1504.0 | 0 |
| 1505.0 | 0 |
| 1506.0 | 0 |
| 1507.0 | 0 |
| 1508.0 | 0 |
| 1509.0 | 0 |
| 1510.0 | 0 |
| 1511.0 | 0 |
| 1512.0 | 0 |
| 1513.0 | 0 |
| 1514.0 | 0 |
| 1515.0 | 0 |
| 1516.0 | 0 |
| 1517.0 | 0 |
| 1518.0 | 0 |
| 1519.0 | 0 |
| 1520.0 | 0 |
| 1521.0 | 0 |
| 1522.0 | 0 |
| 1523.0 | 0 |
| 1524.0 | 0 |
| 1525.0 | 0 |
| 1526.0 | 0 |
| 1527.0 | 0 |
| 1528.0 | 0 |
| 1529.0 | 0 |
| 1530.0 | 0 |
| 1531.0 | 0 |
| 1532.0 | 0 |
| 1533.0 | 0 |
| 1534.0 | 0 |
| 1535.0 | 0 |
| 1536.0 | 0 |
| 1537.0 | 0 |
| 1538.0 | 0 |
| 1539.0 | 0 |
| 1540.0 | 0 |
| 1541.0 | 0 |
| 1542.0 | 0 |
| 1543.0 | 0 |
| 1544.0 | 0 |
| 1545.0 | 0 |
| 1546.0 | 0 |
| 1547.0 | 0 |
| 1548.0 | 0 |
| 1549.0 | 0 |
| 1550.0 | 0 |
| 1551.0 | 0 |
| 1552.0 | 0 |
| 1553.0 | 0 |
| 1554.0 | 0 |
| 1555.0 | 0 |
| 1556.0 | 0 |
| 1557.0 | 0 |
| 1558.0 | 0 |
| 1559.0 | 0 |
| 1560.0 | 0 |
| 1561.0 | 0 |
| 1562.0 | 0 |
| 1563.0 | 0 |
| 1564.0 | 0 |
| 1565.0 | 0 |
| 1566.0 | 0 |
| 1567.0 | 0 |
| 1568.0 | 0 |
| 1569.0 | 0 |
| 1570.0 | 0 |
| 1571.0 | 0 |
| 1572.0 | 0 |
| 1573.0 | 0 |
| 1574.0 | 0 |
| 1575.0 | 0 |
| 1576.0 | 0 |
| 1577.0 | 0 |
| 1578.0 | 0 |
| 1579.0 | 0 |
| 1580.0 | 0 |
| 1581.0 | 0 |
| 1582.0 | 0 |
| 1583.0 | 0 |
| 1584.0 | 0 |
| 1585.0 | 0 |
| 1586.0 | 0 |
| 1587.0 | 0 |
| 1588.0 | 0 |
| 1589.0 | 0 |
| 1590.0 | 0 |
| 1591.0 | 0 |
| 1592.0 | 0 |
| 1593.0 | 0 |
| 1594.0 | 0 |
| 1595.0 | 0 |
| 1596.0 | 0 |
| 1597.0 | 0 |
| 1598.0 | 0 |
| 1599.0 | 0 |
| 1600.0 | 0 |
| 1601.0 | 0 |
| 1602.0 | 0 |
| 1603.0 | 0 |
| 1604.0 | 0 |
| 1605.0 | 0 |
| 1606.0 | 0 |
| 1607.0 | 0 |
| 1608.0 | 0 |
| 1609.0 | 0 |
| 1610.0 | 0 |
| 1611.0 | 0 |
| 1612.0 | 0 |
| 1613.0 | 0 |
| 1614.0 | 0 |
| 1615.0 | 0 |
| 1616.0 | 0.027 |
| 1617.0 | 0.042 |
| 1618.0 | 0.047 |
| 1619.0 | 0.044 |
| 1620.0 | 0.083 |
| 1621.0 | 0.094 |
| 1622.0 | 0.101 |
| 1623.0 | 0.104 |
| 1624.0 | 0.108 |
| 1625.0 | 0.109 |
| 1626.0 | 0.109 |
| 1627.0 | 0.116 |
| 1628.0 | 0.097 |
| 1629.0 | 0.087 |
| 1630.0 | 0.086 |
| 1631.0 | 0.086 |
| 1632.0 | 0.084 |
| 1633.0 | 0.083 |
| 1634.0 | 0.08 |
| 1635.0 | 0.08 |
| 1636.0 | 0.078 |
| 1637.0 | 0.073 |
| 1638.0 | 0.064 |
| 1639.0 | 0.068 |
| 1640.0 | 0.053 |
| 1641.0 | 0.052 |
| 1642.0 | 0.05 |
| 1643.0 | 0.018 |
| 1644.0 | 0.007 |
| 1645.0 | 0.005 |
| 1646.0 | 0.005 |
| 1647.0 | 0.005 |
| 1648.0 | 0.005 |
| 1649.0 | 0.005 |
| 1650.0 | 0.005 |
| 1651.0 | 0.005 |
| 1652.0 | 0.005 |
| 1653.0 | 0.005 |
| 1654.0 | 0.005 |
| 1655.0 | 0.005 |
| 1656.0 | 0.005 |
| 1657.0 | 0.005 |
| 1658.0 | 0.005 |
| 1659.0 | 0.005 |
| 1660.0 | 0.005 |
| 1661.0 | 0.005 |
| 1662.0 | 0.005 |
| 1663.0 | 0.005 |
| 1664.0 | 0.005 |
| 1665.0 | 0.005 |
| 1666.0 | 0.005 |
| 1667.0 | 0.005 |
| 1668.0 | 0.005 |
| 1669.0 | 0.005 |
| 1670.0 | 0.005 |
| 1671.0 | 0.005 |
| 1672.0 | 0.005 |
| 1673.0 | 0.005 |
| 1674.0 | 0.005 |
| 1675.0 | 0.005 |
| 1676.0 | 0.005 |
| 1677.0 | 0.005 |
| 1678.0 | 0.005 |
| 1679.0 | 0.005 |
| 1680.0 | 0.005 |
| 1681.0 | 0.005 |
| 1682.0 | 0.005 |
| 1683.0 | 0.005 |
| 1684.0 | 0.005 |
| 1685.0 | 0.005 |
| 1686.0 | 0.005 |
| 1687.0 | 0.005 |
| 1688.0 | 0.005 |
| 1689.0 | 0.005 |
| 1690.0 | 0.005 |
| 1691.0 | 0.005 |
| 1692.0 | 0.005 |
| 1693.0 | 0.005 |
| 1694.0 | 0.005 |
| 1695.0 | 0.005 |
| 1696.0 | 0.005 |
| 1697.0 | 0.005 |
| 1698.0 | 0.005 |
| 1699.0 | 0.005 |
| 1700.0 | 0.005 |
| 1701.0 | 0.005 |
| 1702.0 | 0.005 |
| 1703.0 | 0.005 |
| 1704.0 | 0.005 |
| 1705.0 | 0.005 |
| 1706.0 | 0.005 |
| 1707.0 | 0.005 |
| 1708.0 | 0.005 |
| 1709.0 | 0.005 |
| 1710.0 | 0.005 |
| 1711.0 | 0.005 |
| 1712.0 | 0.005 |
| 1713.0 | 0.005 |
| 1714.0 | 0.005 |
| 1715.0 | 0.005 |
| 1716.0 | 0.005 |
| 1717.0 | 0.005 |
| 1718.0 | 0.005 |
| 1719.0 | 0.005 |
| 1720.0 | 0.005 |
| 1721.0 | 0.005 |
| 1722.0 | 0.005 |
| 1723.0 | 0.005 |
| 1724.0 | 0.005 |
| 1725.0 | 0.005 |
| 1726.0 | 0.005 |
| 1727.0 | 0.005 |
| 1728.0 | 0.005 |
| 1729.0 | 0.005 |
| 1730.0 | 0.005 |
| 1731.0 | 0.005 |
| 1732.0 | 0.005 |
| 1733.0 | 0.005 |
| 1734.0 | 0.005 |
| 1735.0 | 0.005 |
| 1736.0 | 0.005 |
| 1737.0 | 0.005 |
| 1738.0 | 0.005 |
| 1739.0 | 0.005 |
| 1740.0 | 0.005 |
| 1741.0 | 0.005 |
| 1742.0 | 0.005 |
| 1743.0 | 0.005 |
| 1744.0 | 0.005 |
| 1745.0 | 0.005 |
| 1746.0 | 0.005 |
| 1747.0 | 0.005 |
| 1748.0 | 0.005 |
| 1749.0 | 0.005 |
| 1750.0 | 0.005 |
| 1751.0 | 0.005 |
| 1752.0 | 0.005 |
| 1753.0 | 0.005 |
| 1754.0 | 0.005 |
| 1755.0 | 0.005 |
| 1756.0 | 0.005 |
| 1757.0 | 0.005 |
| 1758.0 | 0.005 |
| 1759.0 | 0.005 |
| 1760.0 | 0.005 |
| 1761.0 | 0.005 |
| 1762.0 | 0.005 |
| 1763.0 | 0.005 |
| 1764.0 | 0.005 |
| 1765.0 | 0.005 |
| 1766.0 | 0.005 |
| 1767.0 | 0.005 |
| 1768.0 | 0.005 |
| 1769.0 | 0.005 |
| 1770.0 | 0.005 |
| 1771.0 | 0.005 |
| 1772.0 | 0.005 |
| 1773.0 | 0.005 |
| 1774.0 | 0.005 |
| 1775.0 | 0.005 |
| 1776.0 | 0.005 |
| 1777.0 | 0.005 |
| 1778.0 | 0.005 |
| 1779.0 | 0.005 |
| 1780.0 | 0.005 |
| 1781.0 | 0.005 |
| 1782.0 | 0.005 |
| 1783.0 | 0.005 |
| 1784.0 | 0.005 |
| 1785.0 | 0.005 |
| 1786.0 | 0.005 |
| 1787.0 | 0.005 |
| 1788.0 | 0.005 |
| 1789.0 | 0.005 |
| 1790.0 | 0.005 |
| 1791.0 | 0.005 |
| 1792.0 | 0.005 |
| 1793.0 | 0.005 |
| 1794.0 | 0.005 |
| 1795.0 | 0.005 |
| 1796.0 | 0.005 |
| 1797.0 | 0.005 |
| 1798.0 | 0.005 |
| 1799.0 | 0.005 |
| 1800.0 | 0.005 |
| 1801.0 | 0.005 |
| 1802.0 | 0.005 |
| 1803.0 | 0.005 |
| 1804.0 | 0.005 |
| 1805.0 | 0.005 |
| 1806.0 | 0.005 |
| 1807.0 | 0.005 |
| 1808.0 | 0.005 |
| 1809.0 | 0.005 |
| 1810.0 | 0.005 |
| 1811.0 | 0.005 |
| 1812.0 | 0.005 |
| 1813.0 | 0.005 |
| 1814.0 | 0.005 |
| 1815.0 | 0.005 |
| 1816.0 | 0.005 |
| 1817.0 | 0.005 |
| 1818.0 | 0.005 |
| 1819.0 | 0.005 |
| 1820.0 | 0.005 |
| 1821.0 | 0.005 |
| 1822.0 | 0.005 |
| 1823.0 | 0.005 |
| 1824.0 | 0.005 |
| 1825.0 | 0.005 |
| 1826.0 | 0.005 |
| 1827.0 | 0.005 |
| 1828.0 | 0.005 |
| 1829.0 | 0.005 |
| 1830.0 | 0.005 |
| 1831.0 | 0.005 |
| 1832.0 | 0.005 |
| 1833.0 | 0.005 |
| 1834.0 | 0.005 |
| 1835.0 | 0.005 |
| 1836.0 | 0 |
| 1837.0 | 0 |
| 1838.0 | 0 |
| 1839.0 | 0 |
| 1840.0 | 0 |
| 1841.0 | 0 |
| 1842.0 | 0 |
| 1843.0 | 0 |
| 1844.0 | 0 |
| 1845.0 | 0 |
| 1846.0 | 0 |
| 1847.0 | 0 |
| 1848.0 | 0 |
| 1849.0 | 0 |
| 1850.0 | 0 |
| 1851.0 | 0 |
| 1852.0 | 0 |
| 1853.0 | 0 |
| 1854.0 | 0 |
| 1855.0 | 0 |
| 1856.0 | 0 |
| 1857.0 | 0 |
| 1858.0 | 0 |
| 1859.0 | 0 |
| 1860.0 | 0 |
| 1861.0 | 0 |
| 1862.0 | 0 |
| 1863.0 | 0 |
| 1864.0 | 0 |
| 1865.0 | 0 |
| 1866.0 | 0 |
| 1867.0 | 0 |
| 1868.0 | 0 |
| 1869.0 | 0 |
| 1870.0 | 0 |
| 1871.0 | 0 |
| 1872.0 | 0 |
| 1873.0 | 0 |
| 1874.0 | 0 |
| 1875.0 | 0 |
| 1876.0 | 0 |
| 1877.0 | 0 |
| 1878.0 | 0 |
| 1879.0 | 0 |
| 1880.0 | 0 |
| 1881.0 | 0 |
| 1882.0 | 0 |
| 1883.0 | 0 |
| 1884.0 | 0 |
| 1885.0 | 0 |
| 1886.0 | 0 |
| 1887.0 | 0 |
| 1888.0 | 0 |
| 1889.0 | 0 |
| 1890.0 | 0 |
| 1891.0 | 0 |
| 1892.0 | 0 |
| 1893.0 | 0 |
| 1894.0 | 0 |
| 1895.0 | 0 |
| 1896.0 | 0 |
| 1897.0 | 0 |
| 1898.0 | 0.005 |
| 1899.0 | 0.005 |
| 1900.0 | 0.005 |
| 1901.0 | 0.005 |
| 1902.0 | 0.005 |
| 1903.0 | 0.005 |
| 1904.0 | 0.005 |
| 1905.0 | 0.005 |
| 1906.0 | 0.005 |
| 1907.0 | 0.005 |
| 1908.0 | 0.005 |
| 1909.0 | 0.005 |
| 1910.0 | 0.005 |
| 1911.0 | 0.005 |
| 1912.0 | 0.005 |
| 1913.0 | 0.005 |
| 1914.0 | 0.005 |
| 1915.0 | 0.005 |
| 1916.0 | 0.005 |
| 1917.0 | 0.005 |
| 1918.0 | 0.005 |
| 1919.0 | 0.005 |
| 1920.0 | 0.005 |
| 1921.0 | 0.005 |
| 1922.0 | 0.005 |
| 1923.0 | 0.005 |
| 1924.0 | 0.005 |
| 1925.0 | 0.005 |
| 1926.0 | 0.005 |
| 1927.0 | 0.005 |
| 1928.0 | 0.005 |
| 1929.0 | 0.005 |
| 1930.0 | 0.005 |
| 1931.0 | 0.005 |
| 1932.0 | 0.005 |
| 1933.0 | 0.005 |
| 1934.0 | 0.005 |
| 1935.0 | 0.005 |
| 1936.0 | 0.005 |
| 1937.0 | 0.005 |
| 1938.0 | 0.005 |
| 1939.0 | 0.005 |
| 1940.0 | 0.005 |
| 1941.0 | 0.005 |
| 1942.0 | 0.005 |
| 1943.0 | 0.005 |
| 1944.0 | 0.005 |
| 1945.0 | 0.005 |
| 1946.0 | 0.005 |
| 1947.0 | 0.005 |
| 1948.0 | 0.005 |
| 1949.0 | 0.005 |
| 1950.0 | 0.005 |
| 1951.0 | 0.005 |
| 1952.0 | 0.005 |
| 1953.0 | 0.005 |
| 1954.0 | 0.005 |
| 1955.0 | 0.005 |
| 1956.0 | 0.005 |
| 1957.0 | 0.005 |
| 1958.0 | 0.005 |
| 1959.0 | 0.005 |
| 1960.0 | 0.005 |
| 1961.0 | 0.005 |
| 1962.0 | 0.005 |
| 1963.0 | 0.005 |
| 1964.0 | 0.005 |
| 1965.0 | 0.005 |
| 1966.0 | 0.005 |
| 1967.0 | 0.005 |
| 1968.0 | 0.005 |
| 1969.0 | 0.005 |
| 1970.0 | 0.005 |
| 1971.0 | 0.005 |
| 1972.0 | 0.005 |
| 1973.0 | 0.005 |
| 1974.0 | 0.005 |
| 1975.0 | 0.005 |
| 1976.0 | 0.005 |
| 1977.0 | 0.005 |
| 1978.0 | 0.005 |
| 1979.0 | 0.005 |
| 1980.0 | 0.005 |
| 1981.0 | 0.005 |
| 1982.0 | 0.005 |
| 1983.0 | 0.005 |
| 1984.0 | 0.005 |
| 1985.0 | 0.005 |
| 1986.0 | 0.005 |
| 1987.0 | 0.005 |
| 1988.0 | 0.005 |
| 1989.0 | 0.005 |
| 1990.0 | 0.005 |
| 1991.0 | 0.005 |
| 1992.0 | 0.005 |
| 1993.0 | 0.005 |
| 1994.0 | 0.005 |
| 1995.0 | 0.005 |
| 1996.0 | 0.005 |
| 1997.0 | 0.005 |
| 1998.0 | 0.005 |
| 1999.0 | 0.005 |
| 2000.0 | 0.005 |
| 2001.0 | 0.005 |
| 2002.0 | 0.005 |
| 2003.0 | 0.005 |
| 2004.0 | 0.005 |
| 2005.0 | 0.005 |
| 2006.0 | 0.005 |
| 2007.0 | 0.005 |
| 2008.0 | 0.005 |
| 2009.0 | 0.005 |
| 2010.0 | 0.005 |
| 2011.0 | 0.005 |
| 2012.0 | 0.005 |
| 2013.0 | 0.005 |
| 2014.0 | 0.005 |
| 2015.0 | 0.005 |
| 2016.0 | 0.005 |
| 2017.0 | 0.005 |
| 2018.0 | 0.005 |
| 2019.0 | 0.005 |
| 2020.0 | 0.005 |
| 2021.0 | 0.005 |
| 2022.0 | 0.005 |
| 2023.0 | 0.005 |
| 2024.0 | 0.005 |
| 2025.0 | 0.005 |
| 2026.0 | 0.005 |
| 2027.0 | 0.005 |
| 2028.0 | 0.005 |
| 2029.0 | 0.005 |
| 2030.0 | 0.005 |
| 2031.0 | 0.005 |
| 2032.0 | 0.005 |
| 2033.0 | 0.005 |
| 2034.0 | 0.005 |
| 2035.0 | 0.005 |
| 2036.0 | 0.005 |
| 2037.0 | 0.005 |
| 2038.0 | 0.005 |
| 2039.0 | 0.005 |
| 2040.0 | 0.005 |
| 2041.0 | 0.005 |
| 2042.0 | 0.005 |
| 2043.0 | 0.005 |
| 2044.0 | 0.005 |
| 2045.0 | 0.005 |
| 2046.0 | 0.005 |
| 2047.0 | 0.005 |
| 2048.0 | 0.005 |
| 2049.0 | 0.005 |
| 2050.0 | 0.005 |
| 2051.0 | 0.005 |
| 2052.0 | 0.005 |
| 2053.0 | 0.005 |
| 2054.0 | 0.005 |
| 2055.0 | 0.005 |
| 2056.0 | 0.005 |
| 2057.0 | 0.005 |
| 2058.0 | 0.005 |
| 2059.0 | 0.005 |
| 2060.0 | 0.005 |
| 2061.0 | 0.005 |
| 2062.0 | 0.005 |
| 2063.0 | 0.005 |
| 2064.0 | 0.005 |
| 2065.0 | 0.005 |
| 2066.0 | 0.005 |
| 2067.0 | 0.005 |
| 2068.0 | 0.005 |
| 2069.0 | 0.005 |
| 2070.0 | 0.005 |
| 2071.0 | 0.005 |
| 2072.0 | 0.005 |
| 2073.0 | 0.005 |
| 2074.0 | 0.005 |
| 2075.0 | 0.005 |
| 2076.0 | 0.005 |
| 2077.0 | 0.005 |
| 2078.0 | 0.005 |
| 2079.0 | 0.005 |
| 2080.0 | 0.005 |
| 2081.0 | 0.005 |
| 2082.0 | 0.005 |
| 2083.0 | 0.005 |
| 2084.0 | 0.005 |
| 2085.0 | 0.005 |
| 2086.0 | 0.005 |
| 2087.0 | 0.005 |
| 2088.0 | 0.005 |
| 2089.0 | 0.005 |
| 2090.0 | 0.005 |
| 2091.0 | 0.005 |
| 2092.0 | 0.005 |
| 2093.0 | 0.005 |
| 2094.0 | 0.005 |
| 2095.0 | 0.005 |
| 2096.0 | 0.005 |
| 2097.0 | 0.005 |
| 2098.0 | 0 |
| 2099.0 | 0 |
| 2100.0 | 0 |
| 2101.0 | 0 |
| 2102.0 | 0 |
| 2103.0 | 0 |
| 2104.0 | 0 |
| 2105.0 | 0 |
| 2106.0 | 0 |
| 2107.0 | 0 |
| 2108.0 | 0 |
| 2109.0 | 0 |
| 2110.0 | 0 |
| 2111.0 | 0 |
| 2112.0 | 0 |
| 2113.0 | 0 |
| 2114.0 | 0 |
| 2115.0 | 0 |
| 2116.0 | 0 |
| 2117.0 | 0 |
| 2118.0 | 0 |
| 2119.0 | 0 |
| 2120.0 | 0 |
| 2121.0 | 0 |
| 2122.0 | 0 |
| 2123.0 | 0 |
| 2124.0 | 0 |
| 2125.0 | 0 |
| 2126.0 | 0 |
| 2127.0 | 0 |
| 2128.0 | 0 |
| 2129.0 | 0 |
| 2130.0 | 0 |
| 2131.0 | 0 |
| 2132.0 | 0 |
| 2133.0 | 0 |
| 2134.0 | 0 |
| 2135.0 | 0 |
| 2136.0 | 0 |
| 2137.0 | 0 |
| 2138.0 | 0 |
| 2139.0 | 0 |
| 2140.0 | 0 |
| 2141.0 | 0 |
| 2142.0 | 0 |
| 2143.0 | 0 |
| 2144.0 | 0 |
| 2145.0 | 0 |
| 2146.0 | 0 |
| 2147.0 | 0 |
| 2148.0 | 0 |
| 2149.0 | 0 |
| 2150.0 | 0 |
| 2151.0 | 0 |
| 2152.0 | 0 |
| 2153.0 | 0 |
| 2154.0 | 0 |
| 2155.0 | 0 |
| 2156.0 | 0 |
| 2157.0 | 0 |
| 2158.0 | 0 |
| 2159.0 | 0 |
| 2160.0 | 0 |
| 2161.0 | 0 |
| 2162.0 | 0 |
| 2163.0 | 0 |
| 2164.0 | 0 |
| 2165.0 | 0 |
| 2166.0 | 0 |
| 2167.0 | 0 |
| 2168.0 | 0 |
| 2169.0 | 0 |
| 2170.0 | 0 |
| 2171.0 | 0 |
| 2172.0 | 0 |
| 2173.0 | 0 |
| 2174.0 | 0 |
| 2175.0 | 0 |
| 2176.0 | 0 |
| 2177.0 | 0 |
| 2178.0 | 0 |
| 2179.0 | 0 |
| 2180.0 | 0 |
| 2181.0 | 0 |
| 2182.0 | 0 |
| 2183.0 | 0 |
| 2184.0 | 0 |
| 2185.0 | 0 |
| 2186.0 | 0 |
| 2187.0 | 0.005 |
| 2188.0 | 0.005 |
| 2189.0 | 0.005 |
| 2190.0 | 0.005 |
| 2191.0 | 0.005 |
| 2192.0 | 0.005 |
| 2193.0 | 0.005 |
| 2194.0 | 0.005 |
| 2195.0 | 0.005 |
| 2196.0 | 0 |
| 2197.0 | 0 |
| 2198.0 | 0 |
| 2199.0 | 0 |
| 2200.0 | 0 |
| 2201.0 | 0 |
| 2202.0 | 0 |
| 2203.0 | 0 |
| 2204.0 | 0 |
| 2205.0 | 0 |
| 2206.0 | 0 |
| 2207.0 | 0 |
| 2208.0 | 0 |
| 2209.0 | 0 |
| 2210.0 | 0 |
| 2211.0 | 0 |
| 2212.0 | 0 |
| 2213.0 | 0 |
| 2214.0 | 0 |
| 2215.0 | 0 |
| 2216.0 | 0 |
| 2217.0 | 0 |
| 2218.0 | 0 |
| 2219.0 | 0 |
| 2220.0 | 0 |
| 2221.0 | 0 |
| 2222.0 | 0 |
| 2223.0 | 0 |
| 2224.0 | 0 |
| 2225.0 | 0 |
| 2226.0 | 0 |
| 2227.0 | 0 |
| 2228.0 | 0 |
| 2229.0 | 0 |
| 2230.0 | 0 |
| 2231.0 | 0 |
| 2232.0 | 0 |
| 2233.0 | 0 |
| 2234.0 | 0 |
| 2235.0 | 0 |
| 2236.0 | 0 |
| 2237.0 | 0 |
| 2238.0 | 0 |
| 2239.0 | 0 |
| 2240.0 | 0 |
| 2241.0 | 0 |
| 2242.0 | 0 |
| 2243.0 | 0 |
| 2244.0 | 0 |
| 2245.0 | 0 |
| 2246.0 | 0 |
| 2247.0 | 0 |
| 2248.0 | 0 |
| 2249.0 | 0 |
| 2250.0 | 0 |
| 2251.0 | 0 |
| 2252.0 | 0 |
| 2253.0 | 0 |
| 2254.0 | 0 |
| 2255.0 | 0 |
| 2256.0 | 0 |
| 2257.0 | 0 |
| 2258.0 | 0 |
| 2259.0 | 0 |
| 2260.0 | 0 |
| 2261.0 | 0 |
| 2262.0 | 0 |
| 2263.0 | 0 |
| 2264.0 | 0 |
| 2265.0 | 0 |
| 2266.0 | 0 |
| 2267.0 | 0 |
| 2268.0 | 0 |
| 2269.0 | 0 |
| 2270.0 | 0 |
| 2271.0 | 0 |
| 2272.0 | 0 |
| 2273.0 | 0 |
| 2274.0 | 0 |
| 2275.0 | 0 |
| 2276.0 | 0 |
| 2277.0 | 0 |
| 2278.0 | 0 |
| 2279.0 | 0 |
| 2280.0 | 0 |
| 2281.0 | 0 |
| 2282.0 | 0 |
| 2283.0 | 0.005 |
| 2284.0 | 0.005 |
| 2285.0 | 0.005 |
| 2286.0 | 0.005 |
| 2287.0 | 0.005 |
| 2288.0 | 0.005 |
| 2289.0 | 0.005 |
| 2290.0 | 0.005 |
| 2291.0 | 0.005 |
| 2292.0 | 0.005 |
| 2293.0 | 0.005 |
| 2294.0 | 0.005 |
| 2295.0 | 0.005 |
| 2296.0 | 0.005 |
| 2297.0 | 0.005 |
| 2298.0 | 0 |
| 2299.0 | 0 |
| 2300.0 | 0 |
| 2301.0 | 0 |
| 2302.0 | 0 |
| 2303.0 | 0 |
| 2304.0 | 0 |
| 2305.0 | 0 |
| 2306.0 | 0 |
| 2307.0 | 0 |
| 2308.0 | 0 |
| 2309.0 | 0 |
| 2310.0 | 0 |
| 2311.0 | 0 |
| 2312.0 | 0 |
| 2313.0 | 0 |
| 2314.0 | 0 |
| 2315.0 | 0 |
| 2316.0 | 0 |
| 2317.0 | 0 |
| 2318.0 | 0 |
| 2319.0 | 0 |
| 2320.0 | 0 |
| 2321.0 | 0 |
| 2322.0 | 0 |
| 2323.0 | 0 |
| 2324.0 | 0 |
| 2325.0 | 0 |
| 2326.0 | 0 |
| 2327.0 | 0 |
| 2328.0 | 0 |
| 2329.0 | 0 |
| 2330.0 | 0 |
| 2331.0 | 0 |
| 2332.0 | 0 |
| 2333.0 | 0 |
| 2334.0 | 0 |
| 2335.0 | 0 |
| 2336.0 | 0 |
| 2337.0 | 0 |
| 2338.0 | 0 |
| 2339.0 | 0 |
| 2340.0 | 0 |
| 2341.0 | 0 |
| 2342.0 | 0 |
| 2343.0 | 0 |
| 2344.0 | 0 |
| 2345.0 | 0 |
| 2346.0 | 0.005 |
| 2347.0 | 0 |
| 2348.0 | 0.005 |
| 2349.0 | 0.005 |
| 2350.0 | 0.005 |
| 2351.0 | 0.005 |
| 2352.0 | 0 |
| 2353.0 | 0.005 |
| 2354.0 | 0 |
| 2355.0 | 0 |
| 2356.0 | 0.005 |
| 2357.0 | 0 |
| 2358.0 | 0 |
| 2359.0 | 0.005 |
| 2360.0 | 0.005 |
| 2361.0 | 0 |
| 2362.0 | 0 |
| 2363.0 | 0 |
| 2364.0 | 0 |
| 2365.0 | 0.005 |
| 2366.0 | 0 |
| 2367.0 | 0.005 |
| 2368.0 | 0.005 |
| 2369.0 | 0.005 |
| 2370.0 | 0.005 |
| 2371.0 | 0 |
| 2372.0 | 0 |
| 2373.0 | 0.005 |
| 2374.0 | 0.005 |
| 2375.0 | 0.005 |
| 2376.0 | 0.005 |
| 2377.0 | 0.005 |
| 2378.0 | 0.005 |
| 2379.0 | 0.005 |
| 2380.0 | 0.005 |
| 2381.0 | 0.005 |
| 2382.0 | 0.005 |
| 2383.0 | 0.005 |
| 2384.0 | 0.005 |
| 2385.0 | 0.005 |
| 2386.0 | 0.005 |
| 2387.0 | 0.005 |
| 2388.0 | 0.005 |
| 2389.0 | 0.005 |
| 2390.0 | 0.005 |
| 2391.0 | 0.005 |
| 2392.0 | 0.005 |
| 2393.0 | 0.005 |
| 2394.0 | 0.005 |
| 2395.0 | 0.005 |
| 2396.0 | 0.005 |
| 2397.0 | 0.005 |
| 2398.0 | 0.005 |
| 2399.0 | 0.005 |
| 2400.0 | 0.005 |
| 2401.0 | 0.005 |
| 2402.0 | 0.005 |
| 2403.0 | 0.005 |
| 2404.0 | 0.005 |
| 2405.0 | 0.005 |
| 2406.0 | 0.005 |
| 2407.0 | 0.005 |
| 2408.0 | 0.005 |
| 2409.0 | 0.005 |
| 2410.0 | 0.005 |
| 2411.0 | 0.005 |
| 2412.0 | 0.005 |
| 2413.0 | 0.005 |
| 2414.0 | 0.005 |
| 2415.0 | 0.005 |
| 2416.0 | 0.005 |
| 2417.0 | 0.005 |
| 2418.0 | 0.005 |
| 2419.0 | 0.005 |
| 2420.0 | 0.005 |
| 2421.0 | 0.005 |
| 2422.0 | 0.005 |
| 2423.0 | 0.005 |
| 2424.0 | 0.005 |
| 2425.0 | 0.005 |
| 2426.0 | 0.005 |
| 2427.0 | 0.005 |
| 2428.0 | 0.005 |
| 2429.0 | 0.005 |
| 2430.0 | 0.005 |
| 2431.0 | 0.005 |
| 2432.0 | 0.005 |
| 2433.0 | 0.005 |
| 2434.0 | 0.005 |
| 2435.0 | 0.005 |
| 2436.0 | 0.005 |
| 2437.0 | 0.005 |
| 2438.0 | 0.005 |
| 2439.0 | 0.005 |
| 2440.0 | 0.005 |
| 2441.0 | 0.005 |
| 2442.0 | 0.005 |
| 2443.0 | 0.005 |
| 2444.0 | 0.005 |
| 2445.0 | 0.005 |
| 2446.0 | 0.005 |
| 2447.0 | 0.005 |
| 2448.0 | 0.005 |
| 2449.0 | 0.005 |
| 2450.0 | 0.005 |
| 2451.0 | 0.005 |
| 2452.0 | 0.005 |
| 2453.0 | 0.005 |
| 2454.0 | 0.005 |
| 2455.0 | 0.005 |
| 2456.0 | 0.005 |
| 2457.0 | 0.005 |
| 2458.0 | 0.005 |
| 2459.0 | 0.005 |
| 2460.0 | 0.005 |
| 2461.0 | 0.005 |
| 2462.0 | 0.005 |
| 2463.0 | 0.005 |
| 2464.0 | 0.005 |
| 2465.0 | 0.005 |
| 2466.0 | 0.005 |
| 2467.0 | 0.005 |
| 2468.0 | 0.005 |
| 2469.0 | 0.005 |
| 2470.0 | 0.005 |
| 2471.0 | 0.005 |
| 2472.0 | 0.005 |
| 2473.0 | 0.005 |
| 2474.0 | 0.005 |
| 2475.0 | 0.005 |
| 2476.0 | 0.005 |
| 2477.0 | 0.005 |
| 2478.0 | 0.005 |
| 2479.0 | 0.005 |
| 2480.0 | 0.005 |
| 2481.0 | 0.005 |
| 2482.0 | 0.005 |
| 2483.0 | 0.005 |
| 2484.0 | 0.005 |
| 2485.0 | 0.005 |
| 2486.0 | 0.005 |
| 2487.0 | 0.005 |
| 2488.0 | 0.005 |
| 2489.0 | 0.005 |
| 2490.0 | 0.005 |
| 2491.0 | 0.005 |
| 2492.0 | 0.005 |
| 2493.0 | 0.005 |
| 2494.0 | 0.005 |
| 2495.0 | 0.005 |
| 2496.0 | 0.005 |
| 2497.0 | 0.005 |
| 2498.0 | 0.005 |
| 2499.0 | 0.005 |
| 2500.0 | 0.005 |
| 2501.0 | 0.005 |
| 2502.0 | 0.005 |
| 2503.0 | 0.005 |
| 2504.0 | 0 |
| 2505.0 | 0 |
| 2506.0 | 0 |
| 2507.0 | 0 |
| 2508.0 | 0 |
| 2509.0 | 0 |
| 2510.0 | 0 |
| 2511.0 | 0 |
| 2512.0 | 0 |
| 2513.0 | 0 |
| 2514.0 | 0 |
| 2515.0 | 0 |
| 2516.0 | 0 |
| 2517.0 | 0 |
| 2518.0 | 0 |
| 2519.0 | 0.005 |
| 2520.0 | 0 |
| 2521.0 | 0 |
| 2522.0 | 0 |
| 2523.0 | 0 |
| 2524.0 | 0 |
| 2525.0 | 0 |
| 2526.0 | 0 |
| 2527.0 | 0 |
| 2528.0 | 0 |
| 2529.0 | 0 |
| 2530.0 | 0 |
| 2531.0 | 0 |
| 2532.0 | 0 |
| 2533.0 | 0 |
| 2534.0 | 0 |
| 2535.0 | 0 |
| 2536.0 | 0 |
| 2537.0 | 0 |
| 2538.0 | 0 |
| 2539.0 | 0 |
| 2540.0 | 0 |
| 2541.0 | 0 |
| 2542.0 | 0 |
| 2543.0 | 0.005 |
| 2544.0 | 0.005 |
| 2545.0 | 0.005 |
| 2546.0 | 0.005 |
| 2547.0 | 0.005 |
| 2548.0 | 0.005 |
| 2549.0 | 0.005 |
| 2550.0 | 0.005 |
| 2551.0 | 0.005 |
| 2552.0 | 0.005 |
| 2553.0 | 0.005 |
| 2554.0 | 0.005 |
| 2555.0 | 0.005 |
| 2556.0 | 0.005 |
| 2557.0 | 0.005 |
| 2558.0 | 0.005 |
| 2559.0 | 0.005 |
| 2560.0 | 0.005 |
| 2561.0 | 0.005 |
| 2562.0 | 0.005 |
| 2563.0 | 0.005 |
| 2564.0 | 0.005 |
| 2565.0 | 0.005 |
| 2566.0 | 0.005 |
| 2567.0 | 0.005 |
| 2568.0 | 0.005 |
| 2569.0 | 0.005 |
| 2570.0 | 0.005 |
| 2571.0 | 0.005 |
| 2572.0 | 0.005 |
| 2573.0 | 0.005 |
| 2574.0 | 0.005 |
| 2575.0 | 0.005 |
| 2576.0 | 0.005 |
| 2577.0 | 0.005 |
| 2578.0 | 0.005 |
| 2579.0 | 0.005 |
| 2580.0 | 0.005 |
| 2581.0 | 0.005 |
| 2582.0 | 0.005 |
| 2583.0 | 0.005 |
| 2584.0 | 0.005 |
| 2585.0 | 0.005 |
| 2586.0 | 0.005 |
| 2587.0 | 0.005 |
| 2588.0 | 0.005 |
| 2589.0 | 0.005 |
| 2590.0 | 0.005 |
| 2591.0 | 0.005 |
| 2592.0 | 0.005 |
| 2593.0 | 0.005 |
| 2594.0 | 0.005 |
| 2595.0 | 0.005 |
| 2596.0 | 0.005 |
| 2597.0 | 0.005 |
| 2598.0 | 0.005 |
| 2599.0 | 0.005 |
| 2600.0 | 0.005 |
| 2601.0 | 0 |
| 2602.0 | 0 |
| 2603.0 | 0 |
| 2604.0 | 0 |
| 2605.0 | 0 |
| 2606.0 | 0 |
| 2607.0 | 0 |
| 2608.0 | 0 |
| 2609.0 | 0 |
| 2610.0 | 0 |
| 2611.0 | 0 |
| 2612.0 | 0 |
| 2613.0 | 0 |
| 2614.0 | 0 |
| 2615.0 | 0 |
| 2616.0 | 0 |
| 2617.0 | 0 |
| 2618.0 | 0 |
| 2619.0 | 0 |
| 2620.0 | 0 |
| 2621.0 | 0 |
| 2622.0 | 0 |
| 2623.0 | 0 |
| 2624.0 | 0 |
| 2625.0 | 0 |
| 2626.0 | 0 |
| 2627.0 | 0 |
| 2628.0 | 0 |
| 2629.0 | 0 |
| 2630.0 | 0 |
| 2631.0 | 0 |
| 2632.0 | 0 |
| 2633.0 | 0 |
| 2634.0 | 0 |
| 2635.0 | 0 |
| 2636.0 | 0 |
| 2637.0 | 0 |
| 2638.0 | 0 |
| 2639.0 | 0 |
| 2640.0 | 0 |
| 2641.0 | 0 |
| 2642.0 | 0.005 |
| 2643.0 | 0.005 |
| 2644.0 | 0 |
| 2645.0 | 0.005 |
| 2646.0 | 0.005 |
| 2647.0 | 0.005 |
| 2648.0 | 0.005 |
| 2649.0 | 0.005 |
| 2650.0 | 0.005 |
| 2651.0 | 0.005 |
| 2652.0 | 0.005 |
| 2653.0 | 0.005 |
| 2654.0 | 0 |
| 2655.0 | 0.005 |
| 2656.0 | 0.005 |
| 2657.0 | 0.005 |
| 2658.0 | 0.005 |
| 2659.0 | 0.005 |
| 2660.0 | 0.005 |
| 2661.0 | 0.005 |
| 2662.0 | 0.005 |
| 2663.0 | 0.005 |
| 2664.0 | 0.005 |
| 2665.0 | 0.005 |
| 2666.0 | 0.005 |
| 2667.0 | 0.005 |
| 2668.0 | 0.005 |
| 2669.0 | 0.005 |
| 2670.0 | 0.005 |
| 2671.0 | 0.005 |
| 2672.0 | 0.005 |
| 2673.0 | 0.005 |
| 2674.0 | 0.005 |
| 2675.0 | 0.005 |
| 2676.0 | 0.005 |
| 2677.0 | 0.005 |
| 2678.0 | 0.005 |
| 2679.0 | 0.005 |
| 2680.0 | 0 |
| 2681.0 | 0 |
| 2682.0 | 0 |
| 2683.0 | 0 |
| 2684.0 | 0 |
| 2685.0 | 0 |
| 2686.0 | 0 |
| 2687.0 | 0 |
| 2688.0 | 0 |
| 2689.0 | 0 |
| 2690.0 | 0 |
| 2691.0 | 0 |
| 2692.0 | 0 |
| 2693.0 | 0 |
| 2694.0 | 0 |
| 2695.0 | 0 |
| 2696.0 | 0 |
| 2697.0 | 0 |
| 2698.0 | 0 |
| 2699.0 | 0 |
| 2700.0 | 0 |
| 2701.0 | 0 |
| 2702.0 | 0 |
| 2703.0 | 0 |
| 2704.0 | 0 |
| 2705.0 | 0 |
| 2706.0 | 0 |
| 2707.0 | 0 |
| 2708.0 | 0.011 |
| 2709.0 | 0.036 |
| 2710.0 | 0.034 |
| 2711.0 | 0.032 |
| 2712.0 | 0.024 |
| 2713.0 | 0.009 |
| 2714.0 | 0.006 |
| 2715.0 | 0.007 |
| 2716.0 | 0.01 |
| 2717.0 | 0.014 |
| 2718.0 | 0.038 |
| 2719.0 | 0.037 |
| 2720.0 | 0.04 |
| 2721.0 | 0.046 |
| 2722.0 | 0.051 |
| 2723.0 | 0.067 |
| 2724.0 | 0.092 |
| 2725.0 | 0.141 |
| 2726.0 | 0.132 |
| 2727.0 | 0.135 |
| 2728.0 | 0.132 |
| 2729.0 | 0.143 |
| 2730.0 | 0.148 |
| 2731.0 | 0.149 |
| 2732.0 | 0.148 |
| 2733.0 | 0.147 |
| 2734.0 | 0.146 |
| 2735.0 | 0.145 |
| 2736.0 | 0.145 |
| 2737.0 | 0.144 |
| 2738.0 | 0.141 |
| 2739.0 | 0.144 |
| 2740.0 | 0.145 |
| 2741.0 | 0.144 |
| 2742.0 | 0.143 |
| 2743.0 | 0.142 |
| 2744.0 | 0.142 |
| 2745.0 | 0.143 |
| 2746.0 | 0.143 |
| 2747.0 | 0.144 |
| 2748.0 | 0.145 |
| 2749.0 | 0.145 |
| 2750.0 | 0.144 |
| 2751.0 | 0.145 |
| 2752.0 | 0.15 |
| 2753.0 | 0.15 |
| 2754.0 | 0.15 |
| 2755.0 | 0.148 |
| 2756.0 | 0.149 |
| 2757.0 | 0.148 |
| 2758.0 | 0.147 |
| 2759.0 | 0.149 |
| 2760.0 | 0.146 |
| 2761.0 | 0.149 |
| 2762.0 | 0.145 |
| 2763.0 | 0.149 |
| 2764.0 | 0.15 |
| 2765.0 | 0.146 |
| 2766.0 | 0.148 |
| 2767.0 | 0.148 |
| 2768.0 | 0.148 |
| 2769.0 | 0.146 |
| 2770.0 | 0.146 |
| 2771.0 | 0.149 |
| 2772.0 | 0.149 |
| 2773.0 | 0.148 |
| 2774.0 | 0.15 |
| 2775.0 | 0.15 |
| 2776.0 | 0.148 |
| 2777.0 | 0.148 |
| 2778.0 | 0.149 |
| 2779.0 | 0.15 |
| 2780.0 | 0.15 |
| 2781.0 | 0.146 |
| 2782.0 | 0.148 |
| 2783.0 | 0.149 |
| 2784.0 | 0.15 |
| 2785.0 | 0.15 |
| 2786.0 | 0.15 |
| 2787.0 | 0.147 |
| 2788.0 | 0.147 |
| 2789.0 | 0.148 |
| 2790.0 | 0.148 |
| 2791.0 | 0.145 |
| 2792.0 | 0.149 |
| 2793.0 | 0.149 |
| 2794.0 | 0.149 |
| 2795.0 | 0.148 |
| 2796.0 | 0.15 |
| 2797.0 | 0.149 |
| 2798.0 | 0.149 |
| 2799.0 | 0.148 |
| 2800.0 | 0.145 |
| 2801.0 | 0.148 |
| 2802.0 | 0.145 |
| 2803.0 | 0.148 |
| 2804.0 | 0.149 |
| 2805.0 | 0.148 |
| 2806.0 | 0.149 |
| 2807.0 | 0.15 |
| 2808.0 | 0.149 |
| 2809.0 | 0.149 |
| 2810.0 | 0.143 |
| 2811.0 | 0.147 |
| 2812.0 | 0.15 |
| 2813.0 | 0.148 |
| 2814.0 | 0.149 |
| 2815.0 | 0.149 |
| 2816.0 | 0.148 |
| 2817.0 | 0.146 |
| 2818.0 | 0.149 |
| 2819.0 | 0.148 |
| 2820.0 | 0.149 |
| 2821.0 | 0.151 |
| 2822.0 | 0.15 |
| 2823.0 | 0.15 |
| 2824.0 | 0.148 |
| 2825.0 | 0.151 |
| 2826.0 | 0.15 |
| 2827.0 | 0.149 |
| 2828.0 | 0.15 |
| 2829.0 | 0.149 |
| 2830.0 | 0.149 |
| 2831.0 | 0.151 |
| 2832.0 | 0.151 |
| 2833.0 | 0.148 |
| 2834.0 | 0.149 |
| 2835.0 | 0.149 |
| 2836.0 | 0.151 |
| 2837.0 | 0.148 |
| 2838.0 | 0.148 |
| 2839.0 | 0.15 |
| 2840.0 | 0.147 |
| 2841.0 | 0.149 |
| 2842.0 | 0.131 |
| 2843.0 | 0.15 |
| 2844.0 | 0.149 |
| 2845.0 | 0.146 |
| 2846.0 | 0.149 |
| 2847.0 | 0.15 |
| 2848.0 | 0.146 |
| 2849.0 | 0.148 |
| 2850.0 | 0.146 |
| 2851.0 | 0.141 |
| 2852.0 | 0.146 |
| 2853.0 | 0.149 |
| 2854.0 | 0.147 |
| 2855.0 | 0.15 |
| 2856.0 | 0.146 |
| 2857.0 | 0.14 |
| 2858.0 | 0.128 |
| 2859.0 | 0.13 |
| 2860.0 | 0.129 |
| 2861.0 | 0.121 |
| 2862.0 | 0.148 |
| 2863.0 | 0.148 |
| 2864.0 | 0.129 |
| 2865.0 | 0.146 |
| 2866.0 | 0.147 |
| 2867.0 | 0.148 |
| 2868.0 | 0.148 |
| 2869.0 | 0.126 |
| 2870.0 | 0.117 |
| 2871.0 | 0.125 |
| 2872.0 | 0.128 |
| 2873.0 | 0.138 |
| 2874.0 | 0.144 |
| 2875.0 | 0.144 |
| 2876.0 | 0.144 |
| 2877.0 | 0.146 |
| 2878.0 | 0.147 |
| 2879.0 | 0.149 |
| 2880.0 | 0.145 |
| 2881.0 | 0.147 |
| 2882.0 | 0.149 |
| 2883.0 | 0.128 |
| 2884.0 | 0.148 |
| 2885.0 | 0.143 |
| 2886.0 | 0.146 |
| 2887.0 | 0.149 |
| 2888.0 | 0.148 |
| 2889.0 | 0.148 |
| 2890.0 | 0.141 |
| 2891.0 | 0.146 |
| 2892.0 | 0.147 |
| 2893.0 | 0.147 |
| 2894.0 | 0.148 |
| 2895.0 | 0.15 |
| 2896.0 | 0.145 |
| 2897.0 | 0.122 |
| 2898.0 | 0.124 |
| 2899.0 | 0.135 |
| 2900.0 | 0.138 |
| 2901.0 | 0.109 |
| 2902.0 | 0.125 |
| 2903.0 | 0.137 |
| 2904.0 | 0.114 |
| 2905.0 | 0.125 |
| 2906.0 | 0.118 |
| 2907.0 | 0.133 |
| 2908.0 | 0.112 |
| 2909.0 | 0.141 |
| 2910.0 | 0.098 |
| 2911.0 | 0.106 |
| 2912.0 | 0.128 |
| 2913.0 | 0.132 |
| 2914.0 | 0.101 |
| 2915.0 | 0.134 |
| 2916.0 | 0.131 |
| 2917.0 | 0.14 |
| 2918.0 | 0.129 |
| 2919.0 | 0.113 |
| 2920.0 | 0.135 |
| 2921.0 | 0.12 |
| 2922.0 | 0.124 |
| 2923.0 | 0.115 |
| 2924.0 | 0.137 |
| 2925.0 | 0.139 |
| 2926.0 | 0.1 |
| 2927.0 | 0.117 |
| 2928.0 | 0.122 |
| 2929.0 | 0.122 |
| 2930.0 | 0.142 |
| 2931.0 | 0.124 |
| 2932.0 | 0.114 |
| 2933.0 | 0.12 |
| 2934.0 | 0.107 |
| 2935.0 | 0.128 |
| 2936.0 | 0.113 |
| 2937.0 | 0.131 |
| 2938.0 | 0.108 |
| 2939.0 | 0.145 |
| 2940.0 | 0.135 |
| 2941.0 | 0.145 |
| 2942.0 | 0.13 |
| 2943.0 | 0.131 |
| 2944.0 | 0.128 |
| 2945.0 | 0.139 |
| 2946.0 | 0.138 |
| 2947.0 | 0.106 |
| 2948.0 | 0.127 |
| 2949.0 | 0.123 |
| 2950.0 | 0.126 |
| 2951.0 | 0.118 |
| 2952.0 | 0.11 |
| 2953.0 | 0.137 |
| 2954.0 | 0.144 |
| 2955.0 | 0.11 |
| 2956.0 | 0.125 |
| 2957.0 | 0.121 |
| 2958.0 | 0.132 |
| 2959.0 | 0.132 |
| 2960.0 | 0.107 |
| 2961.0 | 0.119 |
| 2962.0 | 0.141 |
| 2963.0 | 0.124 |
| 2964.0 | 0.121 |
| 2965.0 | 0.103 |
| 2966.0 | 0.126 |
| 2967.0 | 0.134 |
| 2968.0 | 0.137 |
| 2969.0 | 0.126 |
| 2970.0 | 0.137 |
| 2971.0 | 0.141 |
| 2972.0 | 0.123 |
| 2973.0 | 0.14 |
| 2974.0 | 0.129 |
| 2975.0 | 0.133 |
| 2976.0 | 0.145 |
| 2977.0 | 0.115 |
| 2978.0 | 0.117 |
| 2979.0 | 0.143 |
| 2980.0 | 0.143 |
| 2981.0 | 0.139 |
| 2982.0 | 0.129 |
| 2983.0 | 0.138 |
| 2984.0 | 0.125 |
| 2985.0 | 0.142 |
| 2986.0 | 0.142 |
| 2987.0 | 0.137 |
| 2988.0 | 0.136 |
| 2989.0 | 0.129 |
| 2990.0 | 0.122 |
| 2991.0 | 0.135 |
| 2992.0 | 0.144 |
| 2993.0 | 0.145 |
| 2994.0 | 0.148 |
| 2995.0 | 0.141 |
| 2996.0 | 0.143 |
| 2997.0 | 0.141 |
| 2998.0 | 0.131 |
| 2999.0 | 0.143 |
| 3000.0 | 0.138 |
| 3001.0 | 0.123 |
| 3002.0 | 0.14 |
| 3003.0 | 0.13 |
| 3004.0 | 0.137 |
| 3005.0 | 0.148 |
| 3006.0 | 0.108 |
| 3007.0 | 0.131 |
| 3008.0 | 0.129 |
| 3009.0 | 0.131 |
| 3010.0 | 0.15 |
| 3011.0 | 0.149 |
| 3012.0 | 0.149 |
| 3013.0 | 0.143 |
| 3014.0 | 0.144 |
| 3015.0 | 0.145 |
| 3016.0 | 0.142 |
| 3017.0 | 0.132 |
| 3018.0 | 0.145 |
| 3019.0 | 0.13 |
| 3020.0 | 0.124 |
| 3021.0 | 0.13 |
| 3022.0 | 0.127 |
| 3023.0 | 0.129 |
| 3024.0 | 0.128 |
| 3025.0 | 0.123 |
| 3026.0 | 0.116 |
| 3027.0 | 0.133 |
| 3028.0 | 0.136 |
| 3029.0 | 0.132 |
| 3030.0 | 0.138 |
| 3031.0 | 0.123 |
| 3032.0 | 0.128 |
| 3033.0 | 0.127 |
| 3034.0 | 0.132 |
| 3035.0 | 0.125 |
| 3036.0 | 0.123 |
| 3037.0 | 0.131 |
| 3038.0 | 0.128 |
| 3039.0 | 0.131 |
| 3040.0 | 0.128 |
| 3041.0 | 0.127 |
| 3042.0 | 0.117 |
| 3043.0 | 0.117 |
| 3044.0 | 0.133 |
| 3045.0 | 0.137 |
| 3046.0 | 0.137 |
| 3047.0 | 0.137 |
| 3048.0 | 0.135 |
| 3049.0 | 0.135 |
| 3050.0 | 0.138 |
| 3051.0 | 0.138 |
| 3052.0 | 0.14 |
| 3053.0 | 0.139 |
| 3054.0 | 0.109 |
| 3055.0 | 0.077 |
| 3056.0 | 0.035 |
| 3057.0 | 0.027 |
| 3058.0 | 0.061 |
| 3059.0 | 0.05 |
| 3060.0 | 0.114 |
| 3061.0 | 0.087 |
| 3062.0 | 0.056 |
| 3063.0 | 0.043 |
| 3064.0 | 0.051 |
| 3065.0 | 0.068 |
| 3066.0 | 0.13 |
| 3067.0 | 0.139 |
| 3068.0 | 0.144 |
| 3069.0 | 0.143 |
| 3070.0 | 0.148 |
| 3071.0 | 0.149 |
| 3072.0 | 0.149 |
| 3073.0 | 0.149 |
| 3074.0 | 0.149 |
| 3075.0 | 0.148 |
| 3076.0 | 0.148 |
| 3077.0 | 0.148 |
| 3078.0 | 0.148 |
| 3079.0 | 0.148 |
| 3080.0 | 0.148 |
| 3081.0 | 0.148 |
| 3082.0 | 0.149 |
| 3083.0 | 0.149 |
| 3084.0 | 0.149 |
| 3085.0 | 0.149 |
| 3086.0 | 0.149 |
| 3087.0 | 0.149 |
| 3088.0 | 0.149 |
| 3089.0 | 0.149 |
| 3090.0 | 0.149 |
| 3091.0 | 0.149 |
| 3092.0 | 0.149 |
| 3093.0 | 0.149 |
| 3094.0 | 0.15 |
| 3095.0 | 0.15 |
| 3096.0 | 0.15 |
| 3097.0 | 0.15 |
| 3098.0 | 0.15 |
| 3099.0 | 0.15 |
| 3100.0 | 0.15 |
| 3101.0 | 0.15 |
| 3102.0 | 0.15 |
| 3103.0 | 0.15 |
| 3104.0 | 0.15 |
| 3105.0 | 0.15 |
| 3106.0 | 0.15 |
| 3107.0 | 0.15 |
| 3108.0 | 0.15 |
| 3109.0 | 0.15 |
| 3110.0 | 0.15 |
| 3111.0 | 0.15 |
| 3112.0 | 0.15 |
| 3113.0 | 0.15 |
| 3114.0 | 0.15 |
| 3115.0 | 0.15 |
| 3116.0 | 0.15 |
| 3117.0 | 0.15 |
| 3118.0 | 0.15 |
| 3119.0 | 0.15 |
| 3120.0 | 0.15 |
| 3121.0 | 0.15 |
| 3122.0 | 0.15 |
| 3123.0 | 0.151 |
| 3124.0 | 0.151 |
| 3125.0 | 0.151 |
| 3126.0 | 0.151 |
| 3127.0 | 0.151 |
| 3128.0 | 0.15 |
| 3129.0 | 0.15 |
| 3130.0 | 0.15 |
| 3131.0 | 0.151 |
| 3132.0 | 0.15 |
| 3133.0 | 0.151 |
| 3134.0 | 0.151 |
| 3135.0 | 0.151 |
| 3136.0 | 0.151 |
| 3137.0 | 0.151 |
| 3138.0 | 0.151 |
| 3139.0 | 0.151 |
| 3140.0 | 0.151 |
| 3141.0 | 0.151 |
| 3142.0 | 0.151 |
| 3143.0 | 0.151 |
| 3144.0 | 0.151 |
| 3145.0 | 0.15 |
| 3146.0 | 0.15 |
| 3147.0 | 0.15 |
| 3148.0 | 0.15 |
| 3149.0 | 0.15 |
| 3150.0 | 0.15 |
| 3151.0 | 0.15 |
| 3152.0 | 0.15 |
| 3153.0 | 0.15 |
| 3154.0 | 0.15 |
| 3155.0 | 0.15 |
| 3156.0 | 0.15 |
| 3157.0 | 0.149 |
| 3158.0 | 0.149 |
| 3159.0 | 0.149 |
| 3160.0 | 0.149 |
| 3161.0 | 0.149 |
| 3162.0 | 0.149 |
| 3163.0 | 0.149 |
| 3164.0 | 0.149 |
| 3165.0 | 0.149 |
| 3166.0 | 0.149 |
| 3167.0 | 0.149 |
| 3168.0 | 0.149 |
| 3169.0 | 0.149 |
| 3170.0 | 0.149 |
| 3171.0 | 0.149 |
| 3172.0 | 0.149 |
| 3173.0 | 0.149 |
| 3174.0 | 0.149 |
| 3175.0 | 0.149 |
| 3176.0 | 0.149 |
| 3177.0 | 0.149 |
| 3178.0 | 0.149 |
| 3179.0 | 0.149 |
| 3180.0 | 0.149 |
| 3181.0 | 0.149 |
| 3182.0 | 0.149 |
| 3183.0 | 0.149 |
| 3184.0 | 0.15 |
| 3185.0 | 0.15 |
| 3186.0 | 0.15 |
| 3187.0 | 0.15 |
| 3188.0 | 0.15 |
| 3189.0 | 0.15 |
| 3190.0 | 0.15 |
| 3191.0 | 0.15 |
| 3192.0 | 0.15 |
| 3193.0 | 0.15 |
| 3194.0 | 0.15 |
| 3195.0 | 0.15 |
| 3196.0 | 0.15 |
| 3197.0 | 0.15 |
| 3198.0 | 0.15 |
| 3199.0 | 0.15 |
| 3200.0 | 0.15 |
| 3201.0 | 0.15 |
| 3202.0 | 0.15 |
| 3203.0 | 0.15 |
| 3204.0 | 0.15 |
| 3205.0 | 0.15 |
| 3206.0 | 0.15 |
| 3207.0 | 0.151 |
| 3208.0 | 0.15 |
| 3209.0 | 0.151 |
| 3210.0 | 0.15 |
| 3211.0 | 0.15 |
| 3212.0 | 0.151 |
| 3213.0 | 0.151 |
| 3214.0 | 0.151 |
| 3215.0 | 0.151 |
| 3216.0 | 0.151 |
| 3217.0 | 0.151 |
| 3218.0 | 0.151 |
| 3219.0 | 0.151 |
| 3220.0 | 0.151 |
| 3221.0 | 0.151 |
| 3222.0 | 0.151 |
| 3223.0 | 0.151 |
| 3224.0 | 0.151 |
| 3225.0 | 0.151 |
| 3226.0 | 0.151 |
| 3227.0 | 0.151 |
| 3228.0 | 0.151 |
| 3229.0 | 0.151 |
| 3230.0 | 0.151 |
| 3231.0 | 0.151 |
| 3232.0 | 0.151 |
| 3233.0 | 0.151 |
| 3234.0 | 0.151 |
| 3235.0 | 0.151 |
| 3236.0 | 0.151 |
| 3237.0 | 0.151 |
| 3238.0 | 0.151 |
| 3239.0 | 0.151 |
| 3240.0 | 0.151 |
| 3241.0 | 0.151 |
| 3242.0 | 0.151 |
| 3243.0 | 0.151 |
| 3244.0 | 0.15 |
| 3245.0 | 0.15 |
| 3246.0 | 0.15 |
| 3247.0 | 0.15 |
| 3248.0 | 0.15 |
| 3249.0 | 0.15 |
| 3250.0 | 0.15 |
| 3251.0 | 0.15 |
| 3252.0 | 0.15 |
| 3253.0 | 0.15 |
| 3254.0 | 0.15 |
| 3255.0 | 0.15 |
| 3256.0 | 0.15 |
| 3257.0 | 0.15 |
| 3258.0 | 0.149 |
| 3259.0 | 0.149 |
| 3260.0 | 0.149 |
| 3261.0 | 0.149 |
| 3262.0 | 0.149 |
| 3263.0 | 0.149 |
| 3264.0 | 0.149 |
| 3265.0 | 0.149 |
| 3266.0 | 0.149 |
| 3267.0 | 0.149 |
| 3268.0 | 0.149 |
| 3269.0 | 0.149 |
| 3270.0 | 0.149 |
| 3271.0 | 0.149 |
| 3272.0 | 0.149 |
| 3273.0 | 0.148 |
| 3274.0 | 0.149 |
| 3275.0 | 0.149 |
| 3276.0 | 0.149 |
| 3277.0 | 0.149 |
| 3278.0 | 0.149 |
| 3279.0 | 0.15 |
| 3280.0 | 0.149 |
| 3281.0 | 0.149 |
| 3282.0 | 0.15 |
| 3283.0 | 0.15 |
| 3284.0 | 0.149 |
| 3285.0 | 0.149 |
| 3286.0 | 0.15 |
| 3287.0 | 0.15 |
| 3288.0 | 0.15 |
| 3289.0 | 0.15 |
| 3290.0 | 0.15 |
| 3291.0 | 0.15 |
| 3292.0 | 0.15 |
| 3293.0 | 0.15 |
| 3294.0 | 0.15 |
| 3295.0 | 0.15 |
| 3296.0 | 0.15 |
| 3297.0 | 0.15 |
| 3298.0 | 0.15 |
| 3299.0 | 0.15 |
| 3300.0 | 0.15 |
| 3301.0 | 0.15 |
| 3302.0 | 0.15 |
| 3303.0 | 0.15 |
| 3304.0 | 0.15 |
| 3305.0 | 0.15 |
| 3306.0 | 0.15 |
| 3307.0 | 0.15 |
| 3308.0 | 0.15 |
| 3309.0 | 0.15 |
| 3310.0 | 0.15 |
| 3311.0 | 0.15 |
| 3312.0 | 0.15 |
| 3313.0 | 0.15 |
| 3314.0 | 0.15 |
| 3315.0 | 0.15 |
| 3316.0 | 0.15 |
| 3317.0 | 0.15 |
| 3318.0 | 0.15 |
| 3319.0 | 0.15 |
| 3320.0 | 0.15 |
| 3321.0 | 0.15 |
| 3322.0 | 0.148 |
| 3323.0 | 0.148 |
| 3324.0 | 0.149 |
| 3325.0 | 0.146 |
| 3326.0 | 0.143 |
| 3327.0 | 0.141 |
| 3328.0 | 0.141 |
| 3329.0 | 0.147 |
| 3330.0 | 0.146 |
| 3331.0 | 0.148 |
| 3332.0 | 0.147 |
| 3333.0 | 0.146 |
| 3334.0 | 0.145 |
| 3335.0 | 0.143 |
| 3336.0 | 0.139 |
| 3337.0 | 0.134 |
| 3338.0 | 0.137 |
| 3339.0 | 0.137 |
| 3340.0 | 0.137 |
| 3341.0 | 0.143 |
| 3342.0 | 0.146 |
| 3343.0 | 0.138 |
| 3344.0 | 0.145 |
| 3345.0 | 0.146 |
| 3346.0 | 0.144 |
| 3347.0 | 0.144 |
| 3348.0 | 0.146 |
| 3349.0 | 0.146 |
| 3350.0 | 0.141 |
| 3351.0 | 0.14 |
| 3352.0 | 0.143 |
| 3353.0 | 0.138 |
| 3354.0 | 0.144 |
| 3355.0 | 0.143 |
| 3356.0 | 0.143 |
| 3357.0 | 0.142 |
| 3358.0 | 0.143 |
| 3359.0 | 0.146 |
| 3360.0 | 0.147 |
| 3361.0 | 0.133 |
| 3362.0 | 0.138 |
| 3363.0 | 0.14 |
| 3364.0 | 0.14 |
| 3365.0 | 0.142 |
| 3366.0 | 0.137 |
| 3367.0 | 0.131 |
| 3368.0 | 0.142 |
| 3369.0 | 0.14 |
| 3370.0 | 0.14 |
| 3371.0 | 0.138 |
| 3372.0 | 0.138 |
| 3373.0 | 0.14 |
| 3374.0 | 0.141 |
| 3375.0 | 0.135 |
| 3376.0 | 0.14 |
| 3377.0 | 0.141 |
| 3378.0 | 0.132 |
| 3379.0 | 0.132 |
| 3380.0 | 0.132 |
| 3381.0 | 0.133 |
| 3382.0 | 0.141 |
| 3383.0 | 0.137 |
| 3384.0 | 0.133 |
| 3385.0 | 0.14 |
| 3386.0 | 0.139 |
| 3387.0 | 0.143 |
| 3388.0 | 0.142 |
| 3389.0 | 0.137 |
| 3390.0 | 0.141 |
| 3391.0 | 0.137 |
| 3392.0 | 0.14 |
| 3393.0 | 0.131 |
| 3394.0 | 0.141 |
| 3395.0 | 0.144 |
| 3396.0 | 0.139 |
| 3397.0 | 0.133 |
| 3398.0 | 0.133 |
| 3399.0 | 0.133 |
| 3400.0 | 0.135 |
| 3401.0 | 0.131 |
| 3402.0 | 0.131 |
| 3403.0 | 0.128 |
| 3404.0 | 0.135 |
| 3405.0 | 0.133 |
| 3406.0 | 0.13 |
| 3407.0 | 0.125 |
| 3408.0 | 0.123 |
| 3409.0 | 0.129 |
| 3410.0 | 0.126 |
| 3411.0 | 0.134 |
| 3412.0 | 0.134 |
| 3413.0 | 0.136 |
| 3414.0 | 0.134 |
| 3415.0 | 0.135 |
| 3416.0 | 0.138 |
| 3417.0 | 0.133 |
| 3418.0 | 0.137 |
| 3419.0 | 0.14 |
| 3420.0 | 0.136 |
| 3421.0 | 0.131 |
| 3422.0 | 0.131 |
| 3423.0 | 0.137 |
| 3424.0 | 0.137 |
| 3425.0 | 0.13 |
| 3426.0 | 0.137 |
| 3427.0 | 0.137 |
| 3428.0 | 0.14 |
| 3429.0 | 0.144 |
| 3430.0 | 0.14 |
| 3431.0 | 0.143 |
| 3432.0 | 0.14 |
| 3433.0 | 0.146 |
| 3434.0 | 0.144 |
| 3435.0 | 0.143 |
| 3436.0 | 0.147 |
| 3437.0 | 0.149 |
| 3438.0 | 0.147 |
| 3439.0 | 0.147 |
| 3440.0 | 0.149 |
| 3441.0 | 0.148 |
| 3442.0 | 0.147 |
| 3443.0 | 0.148 |
| 3444.0 | 0.145 |
| 3445.0 | 0.146 |
| 3446.0 | 0.142 |
| 3447.0 | 0.146 |
| 3448.0 | 0.146 |
| 3449.0 | 0.143 |
| 3450.0 | 0.146 |
| 3451.0 | 0.141 |
| 3452.0 | 0.143 |
| 3453.0 | 0.142 |
| 3454.0 | 0.145 |
| 3455.0 | 0.135 |
| 3456.0 | 0.146 |
| 3457.0 | 0.137 |
| 3458.0 | 0.14 |
| 3459.0 | 0.135 |
| 3460.0 | 0.135 |
| 3461.0 | 0.126 |
| 3462.0 | 0.138 |
| 3463.0 | 0.144 |
| 3464.0 | 0.145 |
| 3465.0 | 0.144 |
| 3466.0 | 0.146 |
| 3467.0 | 0.146 |
| 3468.0 | 0.13 |
| 3469.0 | 0.132 |
| 3470.0 | 0.147 |
| 3471.0 | 0.136 |
| 3472.0 | 0.148 |
| 3473.0 | 0.144 |
| 3474.0 | 0.14 |
| 3475.0 | 0.147 |
| 3476.0 | 0.141 |
| 3477.0 | 0.147 |
| 3478.0 | 0.148 |
| 3479.0 | 0.147 |
| 3480.0 | 0.148 |
| 3481.0 | 0.146 |
| 3482.0 | 0.131 |
| 3483.0 | 0.149 |
| 3484.0 | 0.144 |
| 3485.0 | 0.144 |
| 3486.0 | 0.141 |
| 3487.0 | 0.148 |
| 3488.0 | 0.15 |
| 3489.0 | 0.144 |
| 3490.0 | 0.138 |
| 3491.0 | 0.147 |
| 3492.0 | 0.144 |
| 3493.0 | 0.145 |
| 3494.0 | 0.148 |
| 3495.0 | 0.141 |
| 3496.0 | 0.147 |
| 3497.0 | 0.149 |
| 3498.0 | 0.145 |
| 3499.0 | 0.143 |
| 3500.0 | 0.147 |
| 3501.0 | 0.15 |
| 3502.0 | 0.148 |
| 3503.0 | 0.146 |
| 3504.0 | 0.135 |
| 3505.0 | 0.14 |
| 3506.0 | 0.145 |
| 3507.0 | 0.15 |
| 3508.0 | 0.151 |
| 3509.0 | 0.15 |
| 3510.0 | 0.138 |
| 3511.0 | 0.148 |
| 3512.0 | 0.146 |
| 3513.0 | 0.145 |
| 3514.0 | 0.15 |
| 3515.0 | 0.141 |
| 3516.0 | 0.14 |
| 3517.0 | 0.12 |
| 3518.0 | 0.132 |
| 3519.0 | 0.102 |
| 3520.0 | 0.121 |
| 3521.0 | 0.12 |
| 3522.0 | 0.115 |
| 3523.0 | 0.119 |
| 3524.0 | 0.147 |
| 3525.0 | 0.149 |
| 3526.0 | 0.145 |
| 3527.0 | 0.143 |
| 3528.0 | 0.145 |
| 3529.0 | 0.126 |
| 3530.0 | 0.112 |
| 3531.0 | 0.108 |
| 3532.0 | 0.118 |
| 3533.0 | 0.141 |
| 3534.0 | 0.131 |
| 3535.0 | 0.143 |
| 3536.0 | 0.141 |
| 3537.0 | 0.142 |
| 3538.0 | 0.144 |
| 3539.0 | 0.146 |
| 3540.0 | 0.142 |
| 3541.0 | 0.142 |
| 3542.0 | 0.143 |
| 3543.0 | 0.135 |
| 3544.0 | 0.147 |
| 3545.0 | 0.149 |
| 3546.0 | 0.147 |
| 3547.0 | 0.149 |
| 3548.0 | 0.148 |
| 3549.0 | 0.128 |
| 3550.0 | 0.132 |
| 3551.0 | 0.148 |
| 3552.0 | 0.148 |
| 3553.0 | 0.143 |
| 3554.0 | 0.124 |
| 3555.0 | 0.129 |
| 3556.0 | 0.128 |
| 3557.0 | 0.141 |
| 3558.0 | 0.143 |
| 3559.0 | 0.14 |
| 3560.0 | 0.138 |
| 3561.0 | 0.138 |
| 3562.0 | 0.134 |
| 3563.0 | 0.145 |
| 3564.0 | 0.138 |
| 3565.0 | 0.135 |
| 3566.0 | 0.136 |
| 3567.0 | 0.135 |
| 3568.0 | 0.125 |
| 3569.0 | 0.11 |
| 3570.0 | 0.115 |
| 3571.0 | 0.116 |
| 3572.0 | 0.085 |
| 3573.0 | 0.091 |
| 3574.0 | 0.086 |
| 3575.0 | 0.098 |
| 3576.0 | 0.028 |
| 3577.0 | 0.008 |
| 3578.0 | 0.011 |
| 3579.0 | 0.017 |
| 3580.0 | 0.043 |
| 3581.0 | 0.043 |
| 3582.0 | 0.045 |
| 3583.0 | 0.037 |
| 3584.0 | 0.018 |
| 3585.0 | 0.017 |
| 3586.0 | 0.016 |
| 3587.0 | 0.024 |
| 3588.0 | 0.019 |
| 3589.0 | 0.034 |
| 3590.0 | 0.034 |
| 3591.0 | 0.053 |
| 3592.0 | 0.079 |
| 3593.0 | 0.058 |
| 3594.0 | 0.061 |
| 3595.0 | 0.045 |
| 3596.0 | 0.055 |
| 3597.0 | 0.085 |
| 3598.0 | 0.072 |
| 3599.0 | 0.038 |
| 3600.0 | 0.06 |
| 3601.0 | 0.045 |
| 3602.0 | 0.044 |
| 3603.0 | 0.032 |
| 3604.0 | 0.068 |
| 3605.0 | 0.111 |
| 3606.0 | 0.122 |
| 3607.0 | 0.096 |
| 3608.0 | 0.141 |
| 3609.0 | 0.148 |
| 3610.0 | 0.144 |
| 3611.0 | 0.148 |
| 3612.0 | 0.146 |
| 3613.0 | 0.147 |
| 3614.0 | 0.147 |
| 3615.0 | 0.147 |
| 3616.0 | 0.147 |
| 3617.0 | 0.147 |
| 3618.0 | 0.147 |
| 3619.0 | 0.147 |
| 3620.0 | 0.147 |
| 3621.0 | 0.146 |
| 3622.0 | 0.145 |
| 3623.0 | 0.144 |
| 3624.0 | 0.143 |
| 3625.0 | 0.142 |
| 3626.0 | 0.141 |
| 3627.0 | 0.142 |
| 3628.0 | 0.145 |
| 3629.0 | 0.144 |
| 3630.0 | 0.144 |
| 3631.0 | 0.144 |
| 3632.0 | 0.143 |
| 3633.0 | 0.144 |
| 3634.0 | 0.145 |
| 3635.0 | 0.145 |
| 3636.0 | 0.144 |
| 3637.0 | 0.144 |
| 3638.0 | 0.144 |
| 3639.0 | 0.144 |
| 3640.0 | 0.144 |
| 3641.0 | 0.144 |
| 3642.0 | 0.145 |
| 3643.0 | 0.145 |
| 3644.0 | 0.145 |
| 3645.0 | 0.146 |
| 3646.0 | 0.146 |
| 3647.0 | 0.146 |
| 3648.0 | 0.146 |
| 3649.0 | 0.146 |
| 3650.0 | 0.147 |
| 3651.0 | 0.147 |
| 3652.0 | 0.147 |
| 3653.0 | 0.147 |
| 3654.0 | 0.147 |
| 3655.0 | 0.148 |
| 3656.0 | 0.148 |
| 3657.0 | 0.148 |
| 3658.0 | 0.148 |
| 3659.0 | 0.148 |
| 3660.0 | 0.148 |
| 3661.0 | 0.148 |
| 3662.0 | 0.149 |
| 3663.0 | 0.149 |
| 3664.0 | 0.149 |
| 3665.0 | 0.149 |
| 3666.0 | 0.149 |
| 3667.0 | 0.149 |
| 3668.0 | 0.149 |
| 3669.0 | 0.149 |
| 3670.0 | 0.149 |
| 3671.0 | 0.149 |
| 3672.0 | 0.149 |
| 3673.0 | 0.15 |
| 3674.0 | 0.15 |
| 3675.0 | 0.15 |
| 3676.0 | 0.15 |
| 3677.0 | 0.15 |
| 3678.0 | 0.15 |
| 3679.0 | 0.15 |
| 3680.0 | 0.15 |
| 3681.0 | 0.15 |
| 3682.0 | 0.15 |
| 3683.0 | 0.15 |
| 3684.0 | 0.15 |
| 3685.0 | 0.15 |
| 3686.0 | 0.149 |
| 3687.0 | 0.15 |
| 3688.0 | 0.15 |
| 3689.0 | 0.15 |
| 3690.0 | 0.149 |
| 3691.0 | 0.15 |
| 3692.0 | 0.149 |
| 3693.0 | 0.15 |
| 3694.0 | 0.149 |
| 3695.0 | 0.149 |
| 3696.0 | 0.15 |
| 3697.0 | 0.15 |
| 3698.0 | 0.149 |
| 3699.0 | 0.15 |
| 3700.0 | 0.149 |
| 3701.0 | 0.149 |
| 3702.0 | 0.15 |
| 3703.0 | 0.15 |
| 3704.0 | 0.15 |
| 3705.0 | 0.15 |
| 3706.0 | 0.149 |
| 3707.0 | 0.15 |
| 3708.0 | 0.15 |
| 3709.0 | 0.15 |
| 3710.0 | 0.149 |
| 3711.0 | 0.149 |
| 3712.0 | 0.15 |
| 3713.0 | 0.15 |
| 3714.0 | 0.15 |
| 3715.0 | 0.15 |
| 3716.0 | 0.15 |
| 3717.0 | 0.15 |
| 3718.0 | 0.15 |
| 3719.0 | 0.15 |
| 3720.0 | 0.15 |
| 3721.0 | 0.15 |
| 3722.0 | 0.149 |
| 3723.0 | 0.15 |
| 3724.0 | 0.15 |
| 3725.0 | 0.15 |
| 3726.0 | 0.15 |
| 3727.0 | 0.15 |
| 3728.0 | 0.15 |
| 3729.0 | 0.15 |
| 3730.0 | 0.15 |
| 3731.0 | 0.15 |
| 3732.0 | 0.149 |
| 3733.0 | 0.149 |
| 3734.0 | 0.15 |
| 3735.0 | 0.149 |
| 3736.0 | 0.149 |
| 3737.0 | 0.149 |
| 3738.0 | 0.148 |
| 3739.0 | 0.149 |
| 3740.0 | 0.149 |
| 3741.0 | 0.148 |
| 3742.0 | 0.149 |
| 3743.0 | 0.149 |
| 3744.0 | 0.148 |
| 3745.0 | 0.149 |
| 3746.0 | 0.149 |
| 3747.0 | 0.149 |
| 3748.0 | 0.149 |
| 3749.0 | 0.149 |
| 3750.0 | 0.149 |
| 3751.0 | 0.149 |
| 3752.0 | 0.149 |
| 3753.0 | 0.149 |
| 3754.0 | 0.149 |
| 3755.0 | 0.149 |
| 3756.0 | 0.149 |
| 3757.0 | 0.149 |
| 3758.0 | 0.149 |
| 3759.0 | 0.149 |
| 3760.0 | 0.149 |
| 3761.0 | 0.149 |
| 3762.0 | 0.149 |
| 3763.0 | 0.149 |
| 3764.0 | 0.15 |
| 3765.0 | 0.149 |
| 3766.0 | 0.149 |
| 3767.0 | 0.149 |
| 3768.0 | 0.15 |
| 3769.0 | 0.15 |
| 3770.0 | 0.15 |
| 3771.0 | 0.15 |
| 3772.0 | 0.15 |
| 3773.0 | 0.15 |
| 3774.0 | 0.15 |
| 3775.0 | 0.15 |
| 3776.0 | 0.15 |
| 3777.0 | 0.15 |
| 3778.0 | 0.15 |
| 3779.0 | 0.15 |
| 3780.0 | 0.15 |
| 3781.0 | 0.15 |
| 3782.0 | 0.149 |
| 3783.0 | 0.149 |
| 3784.0 | 0.149 |
| 3785.0 | 0.149 |
| 3786.0 | 0.149 |
| 3787.0 | 0.15 |
| 3788.0 | 0.15 |
| 3789.0 | 0.15 |
| 3790.0 | 0.15 |
| 3791.0 | 0.15 |
| 3792.0 | 0.15 |
| 3793.0 | 0.149 |
| 3794.0 | 0.15 |
| 3795.0 | 0.15 |
| 3796.0 | 0.15 |
| 3797.0 | 0.15 |
| 3798.0 | 0.15 |
| 3799.0 | 0.15 |
| 3800.0 | 0.149 |
| 3801.0 | 0.15 |
| 3802.0 | 0.15 |
| 3803.0 | 0.15 |
| 3804.0 | 0.15 |
| 3805.0 | 0.15 |
| 3806.0 | 0.15 |
| 3807.0 | 0.15 |
| 3808.0 | 0.15 |
| 3809.0 | 0.149 |
| 3810.0 | 0.149 |
| 3811.0 | 0.149 |
| 3812.0 | 0.15 |
| 3813.0 | 0.15 |
| 3814.0 | 0.149 |
| 3815.0 | 0.149 |
| 3816.0 | 0.15 |
| 3817.0 | 0.15 |
| 3818.0 | 0.149 |
| 3819.0 | 0.15 |
| 3820.0 | 0.15 |
| 3821.0 | 0.149 |
| 3822.0 | 0.149 |
| 3823.0 | 0.149 |
| 3824.0 | 0.149 |
| 3825.0 | 0.149 |
| 3826.0 | 0.149 |
| 3827.0 | 0.149 |
| 3828.0 | 0.149 |
| 3829.0 | 0.149 |
| 3830.0 | 0.149 |
| 3831.0 | 0.149 |
| 3832.0 | 0.149 |
| 3833.0 | 0.149 |
| 3834.0 | 0.149 |
| 3835.0 | 0.148 |
| 3836.0 | 0.148 |
| 3837.0 | 0.148 |
| 3838.0 | 0.148 |
| 3839.0 | 0.148 |
| 3840.0 | 0.148 |
| 3841.0 | 0.148 |
| 3842.0 | 0.148 |
| 3843.0 | 0.148 |
| 3844.0 | 0.147 |
| 3845.0 | 0.147 |
| 3846.0 | 0.147 |
| 3847.0 | 0.147 |
| 3848.0 | 0.147 |
| 3849.0 | 0.147 |
| 3850.0 | 0.148 |
| 3851.0 | 0.149 |
| 3852.0 | 0.149 |
| 3853.0 | 0.149 |
| 3854.0 | 0.149 |
| 3855.0 | 0.149 |
| 3856.0 | 0.149 |
| 3857.0 | 0.148 |
| 3858.0 | 0.149 |
| 3859.0 | 0.149 |
| 3860.0 | 0.149 |
| 3861.0 | 0.148 |
| 3862.0 | 0.148 |
| 3863.0 | 0.148 |
| 3864.0 | 0.149 |
| 3865.0 | 0.149 |
| 3866.0 | 0.149 |
| 3867.0 | 0.149 |
| 3868.0 | 0.149 |
| 3869.0 | 0.149 |
| 3870.0 | 0.149 |
| 3871.0 | 0.149 |
| 3872.0 | 0.149 |
| 3873.0 | 0.149 |
| 3874.0 | 0.149 |
| 3875.0 | 0.149 |
| 3876.0 | 0.149 |
| 3877.0 | 0.148 |
| 3878.0 | 0.149 |
| 3879.0 | 0.148 |
| 3880.0 | 0.148 |
| 3881.0 | 0.149 |
| 3882.0 | 0.149 |
| 3883.0 | 0.149 |
| 3884.0 | 0.148 |
| 3885.0 | 0.148 |
| 3886.0 | 0.149 |
| 3887.0 | 0.148 |
| 3888.0 | 0.148 |
| 3889.0 | 0.149 |
| 3890.0 | 0.149 |
| 3891.0 | 0.148 |
| 3892.0 | 0.149 |
| 3893.0 | 0.15 |
| 3894.0 | 0.149 |
| 3895.0 | 0.149 |
| 3896.0 | 0.15 |
| 3897.0 | 0.149 |
| 3898.0 | 0.148 |
| 3899.0 | 0.148 |
| 3900.0 | 0.148 |
| 3901.0 | 0.148 |
| 3902.0 | 0.149 |
| 3903.0 | 0.15 |
| 3904.0 | 0.15 |
| 3905.0 | 0.149 |
| 3906.0 | 0.149 |
| 3907.0 | 0.149 |
| 3908.0 | 0.148 |
| 3909.0 | 0.147 |
| 3910.0 | 0.148 |
| 3911.0 | 0.148 |
| 3912.0 | 0.149 |
| 3913.0 | 0.149 |
| 3914.0 | 0.149 |
| 3915.0 | 0.148 |
| 3916.0 | 0.148 |
| 3917.0 | 0.147 |
| 3918.0 | 0.146 |
| 3919.0 | 0.145 |
| 3920.0 | 0.146 |
| 3921.0 | 0.147 |
| 3922.0 | 0.148 |
| 3923.0 | 0.147 |
| 3924.0 | 0.148 |
| 3925.0 | 0.147 |
| 3926.0 | 0.147 |
| 3927.0 | 0.146 |
| 3928.0 | 0.147 |
| 3929.0 | 0.147 |
| 3930.0 | 0.147 |
| 3931.0 | 0.147 |
| 3932.0 | 0.148 |
| 3933.0 | 0.147 |
| 3934.0 | 0.147 |
| 3935.0 | 0.147 |
| 3936.0 | 0.147 |
| 3937.0 | 0.147 |
| 3938.0 | 0.145 |
| 3939.0 | 0.146 |
| 3940.0 | 0.146 |
| 3941.0 | 0.146 |
| 3942.0 | 0.147 |
| 3943.0 | 0.147 |
| 3944.0 | 0.147 |
| 3945.0 | 0.148 |
| 3946.0 | 0.148 |
| 3947.0 | 0.148 |
| 3948.0 | 0.148 |
| 3949.0 | 0.149 |
| 3950.0 | 0.149 |
| 3951.0 | 0.149 |
| 3952.0 | 0.149 |
| 3953.0 | 0.149 |
| 3954.0 | 0.149 |
| 3955.0 | 0.149 |
| 3956.0 | 0.15 |
| 3957.0 | 0.15 |
| 3958.0 | 0.15 |
| 3959.0 | 0.15 |
| 3960.0 | 0.15 |
| 3961.0 | 0.15 |
| 3962.0 | 0.15 |
| 3963.0 | 0.15 |
| 3964.0 | 0.15 |
| 3965.0 | 0.15 |
| 3966.0 | 0.15 |
| 3967.0 | 0.15 |
| 3968.0 | 0.15 |
| 3969.0 | 0.15 |
| 3970.0 | 0.15 |
| 3971.0 | 0.15 |
| 3972.0 | 0.15 |
| 3973.0 | 0.151 |
| 3974.0 | 0.149 |
| 3975.0 | 0.149 |
| 3976.0 | 0.148 |
| 3977.0 | 0.148 |
| 3978.0 | 0.149 |
| 3979.0 | 0.15 |
| 3980.0 | 0.148 |
| 3981.0 | 0.147 |
| 3982.0 | 0.149 |
| 3983.0 | 0.148 |
| 3984.0 | 0.147 |
| 3985.0 | 0.15 |
| 3986.0 | 0.149 |
| 3987.0 | 0.149 |
| 3988.0 | 0.149 |
| 3989.0 | 0.15 |
| 3990.0 | 0.149 |
| 3991.0 | 0.15 |
| 3992.0 | 0.15 |
| 3993.0 | 0.15 |
| 3994.0 | 0.149 |
| 3995.0 | 0.149 |
| 3996.0 | 0.15 |
| 3997.0 | 0.149 |
| 3998.0 | 0.15 |
| 3999.0 | 0.15 |
| 4000.0 | 0.15 |
| 4001.0 | 0.15 |
| 4002.0 | 0.15 |
| 4003.0 | 0.15 |
| 4004.0 | 0.15 |
| 4005.0 | 0.15 |
| 4006.0 | 0.15 |
| 4007.0 | 0.15 |
| 4008.0 | 0.15 |
| 4009.0 | 0.149 |
| 4010.0 | 0.149 |
| 4011.0 | 0.148 |
| 4012.0 | 0.149 |
| 4013.0 | 0.15 |
| 4014.0 | 0.15 |
| 4015.0 | 0.149 |
| 4016.0 | 0.149 |
| 4017.0 | 0.149 |
| 4018.0 | 0.149 |
| 4019.0 | 0.149 |
| 4020.0 | 0.149 |
| 4021.0 | 0.148 |
| 4022.0 | 0.148 |
| 4023.0 | 0.148 |
| 4024.0 | 0.149 |
| 4025.0 | 0.149 |
| 4026.0 | 0.149 |
| 4027.0 | 0.149 |
| 4028.0 | 0.149 |
| 4029.0 | 0.149 |
| 4030.0 | 0.149 |
| 4031.0 | 0.149 |
| 4032.0 | 0.149 |
| 4033.0 | 0.148 |
| 4034.0 | 0.148 |
| 4035.0 | 0.148 |
| 4036.0 | 0.149 |
| 4037.0 | 0.148 |
| 4038.0 | 0.148 |
| 4039.0 | 0.148 |
| 4040.0 | 0.149 |
| 4041.0 | 0.149 |
| 4042.0 | 0.149 |
| 4043.0 | 0.149 |
| 4044.0 | 0.149 |
| 4045.0 | 0.15 |
| 4046.0 | 0.15 |
| 4047.0 | 0.15 |
| 4048.0 | 0.149 |
| 4049.0 | 0.149 |
| 4050.0 | 0.15 |
| 4051.0 | 0.15 |
| 4052.0 | 0.15 |
| 4053.0 | 0.15 |
| 4054.0 | 0.15 |
| 4055.0 | 0.15 |
| 4056.0 | 0.15 |
| 4057.0 | 0.149 |
| 4058.0 | 0.149 |
| 4059.0 | 0.149 |
| 4060.0 | 0.149 |
| 4061.0 | 0.149 |
| 4062.0 | 0.149 |
| 4063.0 | 0.149 |
| 4064.0 | 0.149 |
| 4065.0 | 0.149 |
| 4066.0 | 0.15 |
| 4067.0 | 0.15 |
| 4068.0 | 0.15 |
| 4069.0 | 0.15 |
| 4070.0 | 0.15 |
| 4071.0 | 0.15 |
| 4072.0 | 0.15 |
| 4073.0 | 0.15 |
| 4074.0 | 0.15 |
| 4075.0 | 0.15 |
| 4076.0 | 0.15 |
| 4077.0 | 0.15 |
| 4078.0 | 0.15 |
| 4079.0 | 0.15 |
| 4080.0 | 0.15 |
| 4081.0 | 0.15 |
| 4082.0 | 0.15 |
| 4083.0 | 0.15 |
| 4084.0 | 0.15 |
| 4085.0 | 0.15 |
| 4086.0 | 0.15 |
| 4087.0 | 0.15 |
| 4088.0 | 0.15 |
| 4089.0 | 0.15 |
| 4090.0 | 0.15 |
| 4091.0 | 0.15 |
| 4092.0 | 0.15 |
| 4093.0 | 0.149 |
| 4094.0 | 0.149 |
| 4095.0 | 0.149 |
| 4096.0 | 0.149 |
| 4097.0 | 0.149 |
| 4098.0 | 0.149 |
| 4099.0 | 0.149 |
| 4100.0 | 0.15 |
| 4101.0 | 0.149 |
| 4102.0 | 0.149 |
| 4103.0 | 0.149 |
| 4104.0 | 0.149 |
| 4105.0 | 0.149 |
| 4106.0 | 0.149 |
| 4107.0 | 0.149 |
| 4108.0 | 0.149 |
| 4109.0 | 0.149 |
| 4110.0 | 0.149 |
| 4111.0 | 0.149 |
| 4112.0 | 0.149 |
| 4113.0 | 0.149 |
| 4114.0 | 0.149 |
| 4115.0 | 0.149 |
| 4116.0 | 0.149 |
| 4117.0 | 0.15 |
| 4118.0 | 0.149 |
| 4119.0 | 0.149 |
| 4120.0 | 0.149 |
| 4121.0 | 0.149 |
| 4122.0 | 0.149 |
| 4123.0 | 0.149 |
| 4124.0 | 0.149 |
| 4125.0 | 0.149 |
| 4126.0 | 0.149 |
| 4127.0 | 0.149 |
| 4128.0 | 0.149 |
| 4129.0 | 0.149 |
| 4130.0 | 0.149 |
| 4131.0 | 0.149 |
| 4132.0 | 0.149 |
| 4133.0 | 0.149 |
| 4134.0 | 0.149 |
| 4135.0 | 0.149 |
| 4136.0 | 0.149 |
| 4137.0 | 0.149 |
| 4138.0 | 0.149 |
| 4139.0 | 0.149 |
| 4140.0 | 0.15 |
| 4141.0 | 0.15 |
| 4142.0 | 0.15 |
| 4143.0 | 0.15 |
| 4144.0 | 0.15 |
| 4145.0 | 0.149 |
| 4146.0 | 0.149 |
| 4147.0 | 0.149 |
| 4148.0 | 0.149 |
| 4149.0 | 0.149 |
| 4150.0 | 0.149 |
| 4151.0 | 0.149 |
| 4152.0 | 0.149 |
| 4153.0 | 0.148 |
| 4154.0 | 0.148 |
| 4155.0 | 0.149 |
| 4156.0 | 0.149 |
| 4157.0 | 0.148 |
| 4158.0 | 0.149 |
| 4159.0 | 0.149 |
| 4160.0 | 0.149 |
| 4161.0 | 0.149 |
| 4162.0 | 0.149 |
| 4163.0 | 0.149 |
| 4164.0 | 0.149 |
| 4165.0 | 0.15 |
| 4166.0 | 0.15 |
| 4167.0 | 0.15 |
| 4168.0 | 0.15 |
| 4169.0 | 0.15 |
| 4170.0 | 0.15 |
| 4171.0 | 0.15 |
| 4172.0 | 0.15 |
| 4173.0 | 0.15 |
| 4174.0 | 0.15 |
| 4175.0 | 0.15 |
| 4176.0 | 0.15 |
| 4177.0 | 0.15 |
| 4178.0 | 0.15 |
| 4179.0 | 0.15 |
| 4180.0 | 0.15 |
| 4181.0 | 0.15 |
| 4182.0 | 0.15 |
| 4183.0 | 0.15 |
| 4184.0 | 0.15 |
| 4185.0 | 0.15 |
| 4186.0 | 0.15 |
| 4187.0 | 0.15 |
| 4188.0 | 0.15 |
| 4189.0 | 0.15 |
| 4190.0 | 0.15 |
| 4191.0 | 0.151 |
| 4192.0 | 0.151 |
| 4193.0 | 0.151 |
| 4194.0 | 0.15 |
| 4195.0 | 0.151 |
| 4196.0 | 0.15 |
| 4197.0 | 0.151 |
| 4198.0 | 0.15 |
| 4199.0 | 0.15 |
| 4200.0 | 0.15 |
| 4201.0 | 0.15 |
| 4202.0 | 0.15 |
| 4203.0 | 0.15 |
| 4204.0 | 0.15 |
| 4205.0 | 0.15 |
| 4206.0 | 0.15 |
| 4207.0 | 0.15 |
| 4208.0 | 0.15 |
| 4209.0 | 0.15 |
| 4210.0 | 0.15 |
| 4211.0 | 0.15 |
| 4212.0 | 0.15 |
| 4213.0 | 0.15 |
| 4214.0 | 0.15 |
| 4215.0 | 0.15 |
| 4216.0 | 0.15 |
| 4217.0 | 0.15 |
| 4218.0 | 0.15 |
| 4219.0 | 0.149 |
| 4220.0 | 0.149 |
| 4221.0 | 0.149 |
| 4222.0 | 0.149 |
| 4223.0 | 0.149 |
| 4224.0 | 0.149 |
| 4225.0 | 0.149 |
| 4226.0 | 0.149 |
| 4227.0 | 0.149 |
| 4228.0 | 0.149 |
| 4229.0 | 0.149 |
| 4230.0 | 0.149 |
| 4231.0 | 0.149 |
| 4232.0 | 0.15 |
| 4233.0 | 0.149 |
| 4234.0 | 0.15 |
| 4235.0 | 0.15 |
| 4236.0 | 0.15 |
| 4237.0 | 0.15 |
| 4238.0 | 0.15 |
| 4239.0 | 0.15 |
| 4240.0 | 0.15 |
| 4241.0 | 0.15 |
| 4242.0 | 0.15 |
| 4243.0 | 0.15 |
| 4244.0 | 0.15 |
| 4245.0 | 0.15 |
| 4246.0 | 0.15 |
| 4247.0 | 0.15 |
| 4248.0 | 0.15 |
| 4249.0 | 0.15 |
| 4250.0 | 0.15 |
| 4251.0 | 0.15 |
| 4252.0 | 0.151 |
| 4253.0 | 0.151 |
| 4254.0 | 0.151 |
| 4255.0 | 0.151 |
| 4256.0 | 0.151 |
| 4257.0 | 0.151 |
| 4258.0 | 0.151 |
| 4259.0 | 0.151 |
| 4260.0 | 0.151 |
| 4261.0 | 0.151 |
| 4262.0 | 0.151 |
| 4263.0 | 0.151 |
| 4264.0 | 0.151 |
| 4265.0 | 0.151 |
| 4266.0 | 0.151 |
| 4267.0 | 0.151 |
| 4268.0 | 0.151 |
| 4269.0 | 0.151 |
| 4270.0 | 0.151 |
| 4271.0 | 0.151 |
| 4272.0 | 0.151 |
| 4273.0 | 0.151 |
| 4274.0 | 0.151 |
| 4275.0 | 0.151 |
| 4276.0 | 0.151 |
| 4277.0 | 0.151 |
| 4278.0 | 0.151 |
| 4279.0 | 0.151 |
| 4280.0 | 0.151 |
| 4281.0 | 0.151 |
| 4282.0 | 0.151 |
| 4283.0 | 0.151 |
| 4284.0 | 0.151 |
| 4285.0 | 0.151 |
| 4286.0 | 0.151 |
| 4287.0 | 0.151 |
| 4288.0 | 0.151 |
| 4289.0 | 0.151 |
| 4290.0 | 0.151 |
| 4291.0 | 0.151 |
| 4292.0 | 0.151 |
| 4293.0 | 0.151 |
| 4294.0 | 0.151 |
| 4295.0 | 0.151 |
| 4296.0 | 0.151 |
| 4297.0 | 0.151 |
| 4298.0 | 0.151 |
| 4299.0 | 0.151 |
| 4300.0 | 0.151 |
| 4301.0 | 0.151 |
| 4302.0 | 0.151 |
| 4303.0 | 0.151 |
| 4304.0 | 0.151 |
| 4305.0 | 0.151 |
| 4306.0 | 0.151 |
| 4307.0 | 0.151 |
| 4308.0 | 0.151 |
| 4309.0 | 0.151 |
| 4310.0 | 0.151 |
| 4311.0 | 0.151 |
| 4312.0 | 0.15 |
| 4313.0 | 0.15 |
| 4314.0 | 0.15 |
| 4315.0 | 0.15 |
| 4316.0 | 0.15 |
| 4317.0 | 0.15 |
| 4318.0 | 0.15 |
| 4319.0 | 0.15 |
| 4320.0 | 0.15 |
| 4321.0 | 0.15 |
| 4322.0 | 0.15 |
| 4323.0 | 0.15 |
| 4324.0 | 0.15 |
| 4325.0 | 0.15 |
| 4326.0 | 0.15 |
| 4327.0 | 0.15 |
| 4328.0 | 0.15 |
| 4329.0 | 0.15 |
| 4330.0 | 0.15 |
| 4331.0 | 0.15 |
| 4332.0 | 0.15 |
| 4333.0 | 0.15 |
| 4334.0 | 0.15 |
| 4335.0 | 0.15 |
| 4336.0 | 0.15 |
| 4337.0 | 0.15 |
| 4338.0 | 0.15 |
| 4339.0 | 0.15 |
| 4340.0 | 0.15 |
| 4341.0 | 0.15 |
| 4342.0 | 0.15 |
| 4343.0 | 0.151 |
| 4344.0 | 0.15 |
| 4345.0 | 0.15 |
| 4346.0 | 0.15 |
| 4347.0 | 0.15 |
| 4348.0 | 0.15 |
| 4349.0 | 0.15 |
| 4350.0 | 0.15 |
| 4351.0 | 0.15 |
| 4352.0 | 0.15 |
| 4353.0 | 0.15 |
| 4354.0 | 0.15 |
| 4355.0 | 0.15 |
| 4356.0 | 0.15 |
| 4357.0 | 0.15 |
| 4358.0 | 0.15 |
| 4359.0 | 0.15 |
| 4360.0 | 0.15 |
| 4361.0 | 0.15 |
| 4362.0 | 0.15 |
| 4363.0 | 0.15 |
| 4364.0 | 0.15 |
| 4365.0 | 0.15 |
| 4366.0 | 0.15 |
| 4367.0 | 0.15 |
| 4368.0 | 0.15 |
| 4369.0 | 0.15 |
| 4370.0 | 0.15 |
| 4371.0 | 0.15 |
| 4372.0 | 0.15 |
| 4373.0 | 0.15 |
| 4374.0 | 0.15 |
| 4375.0 | 0.15 |
| 4376.0 | 0.15 |
| 4377.0 | 0.15 |
| 4378.0 | 0.15 |
| 4379.0 | 0.15 |
| 4380.0 | 0.15 |
| 4381.0 | 0.15 |
| 4382.0 | 0.15 |
| 4383.0 | 0.15 |
| 4384.0 | 0.15 |
| 4385.0 | 0.15 |
| 4386.0 | 0.15 |
| 4387.0 | 0.15 |
| 4388.0 | 0.15 |
| 4389.0 | 0.15 |
| 4390.0 | 0.15 |
| 4391.0 | 0.15 |
| 4392.0 | 0.15 |
| 4393.0 | 0.15 |
| 4394.0 | 0.15 |
| 4395.0 | 0.15 |
| 4396.0 | 0.15 |
| 4397.0 | 0.15 |
| 4398.0 | 0.149 |
| 4399.0 | 0.149 |
| 4400.0 | 0.149 |
| 4401.0 | 0.149 |
| 4402.0 | 0.149 |
| 4403.0 | 0.149 |
| 4404.0 | 0.149 |
| 4405.0 | 0.149 |
| 4406.0 | 0.149 |
| 4407.0 | 0.149 |
| 4408.0 | 0.149 |
| 4409.0 | 0.149 |
| 4410.0 | 0.149 |
| 4411.0 | 0.149 |
| 4412.0 | 0.148 |
| 4413.0 | 0.148 |
| 4414.0 | 0.149 |
| 4415.0 | 0.148 |
| 4416.0 | 0.148 |
| 4417.0 | 0.149 |
| 4418.0 | 0.149 |
| 4419.0 | 0.149 |
| 4420.0 | 0.149 |
| 4421.0 | 0.149 |
| 4422.0 | 0.149 |
| 4423.0 | 0.149 |
| 4424.0 | 0.149 |
| 4425.0 | 0.149 |
| 4426.0 | 0.149 |
| 4427.0 | 0.149 |
| 4428.0 | 0.149 |
| 4429.0 | 0.149 |
| 4430.0 | 0.149 |
| 4431.0 | 0.15 |
| 4432.0 | 0.15 |
| 4433.0 | 0.149 |
| 4434.0 | 0.149 |
| 4435.0 | 0.15 |
| 4436.0 | 0.15 |
| 4437.0 | 0.15 |
| 4438.0 | 0.15 |
| 4439.0 | 0.15 |
| 4440.0 | 0.15 |
| 4441.0 | 0.15 |
| 4442.0 | 0.15 |
| 4443.0 | 0.15 |
| 4444.0 | 0.15 |
| 4445.0 | 0.15 |
| 4446.0 | 0.15 |
| 4447.0 | 0.15 |
| 4448.0 | 0.15 |
| 4449.0 | 0.15 |
| 4450.0 | 0.15 |
| 4451.0 | 0.15 |
| 4452.0 | 0.15 |
| 4453.0 | 0.15 |
| 4454.0 | 0.15 |
| 4455.0 | 0.15 |
| 4456.0 | 0.15 |
| 4457.0 | 0.15 |
| 4458.0 | 0.15 |
| 4459.0 | 0.15 |
| 4460.0 | 0.15 |
| 4461.0 | 0.15 |
| 4462.0 | 0.15 |
| 4463.0 | 0.15 |
| 4464.0 | 0.15 |
| 4465.0 | 0.15 |
| 4466.0 | 0.15 |
| 4467.0 | 0.15 |
| 4468.0 | 0.15 |
| 4469.0 | 0.15 |
| 4470.0 | 0.15 |
| 4471.0 | 0.15 |
| 4472.0 | 0.15 |
| 4473.0 | 0.15 |
| 4474.0 | 0.15 |
| 4475.0 | 0.15 |
| 4476.0 | 0.15 |
| 4477.0 | 0.15 |
| 4478.0 | 0.15 |
| 4479.0 | 0.15 |
| 4480.0 | 0.15 |
| 4481.0 | 0.15 |
| 4482.0 | 0.15 |
| 4483.0 | 0.15 |
| 4484.0 | 0.15 |
| 4485.0 | 0.15 |
| 4486.0 | 0.15 |
| 4487.0 | 0.15 |
| 4488.0 | 0.15 |
| 4489.0 | 0.15 |
| 4490.0 | 0.15 |
| 4491.0 | 0.15 |
| 4492.0 | 0.15 |
| 4493.0 | 0.15 |
| 4494.0 | 0.15 |
| 4495.0 | 0.15 |
| 4496.0 | 0.149 |
| 4497.0 | 0.149 |
| 4498.0 | 0.149 |
| 4499.0 | 0.149 |
| 4500.0 | 0.149 |
| 4501.0 | 0.149 |
| 4502.0 | 0.149 |
| 4503.0 | 0.149 |
| 4504.0 | 0.149 |
| 4505.0 | 0.149 |
| 4506.0 | 0.149 |
| 4507.0 | 0.148 |
| 4508.0 | 0.149 |
| 4509.0 | 0.149 |
| 4510.0 | 0.149 |
| 4511.0 | 0.149 |
| 4512.0 | 0.149 |
| 4513.0 | 0.149 |
| 4514.0 | 0.149 |
| 4515.0 | 0.149 |
| 4516.0 | 0.149 |
| 4517.0 | 0.149 |
| 4518.0 | 0.149 |
| 4519.0 | 0.149 |
| 4520.0 | 0.149 |
| 4521.0 | 0.149 |
| 4522.0 | 0.149 |
| 4523.0 | 0.149 |
| 4524.0 | 0.149 |
| 4525.0 | 0.149 |
| 4526.0 | 0.149 |
| 4527.0 | 0.149 |
| 4528.0 | 0.149 |
| 4529.0 | 0.149 |
| 4530.0 | 0.15 |
| 4531.0 | 0.149 |
| 4532.0 | 0.149 |
| 4533.0 | 0.149 |
| 4534.0 | 0.15 |
| 4535.0 | 0.15 |
| 4536.0 | 0.15 |
| 4537.0 | 0.15 |
| 4538.0 | 0.15 |
| 4539.0 | 0.15 |
| 4540.0 | 0.149 |
| 4541.0 | 0.15 |
| 4542.0 | 0.15 |
| 4543.0 | 0.15 |
| 4544.0 | 0.15 |
| 4545.0 | 0.15 |
| 4546.0 | 0.15 |
| 4547.0 | 0.15 |
| 4548.0 | 0.15 |
| 4549.0 | 0.15 |
| 4550.0 | 0.15 |
| 4551.0 | 0.15 |
| 4552.0 | 0.15 |
| 4553.0 | 0.15 |
| 4554.0 | 0.15 |
| 4555.0 | 0.15 |
| 4556.0 | 0.15 |
| 4557.0 | 0.15 |
| 4558.0 | 0.15 |
| 4559.0 | 0.15 |
| 4560.0 | 0.15 |
| 4561.0 | 0.15 |
| 4562.0 | 0.15 |
| 4563.0 | 0.15 |
| 4564.0 | 0.15 |
| 4565.0 | 0.15 |
| 4566.0 | 0.15 |
| 4567.0 | 0.15 |
| 4568.0 | 0.15 |
| 4569.0 | 0.15 |
| 4570.0 | 0.15 |
| 4571.0 | 0.15 |
| 4572.0 | 0.15 |
| 4573.0 | 0.15 |
| 4574.0 | 0.15 |
| 4575.0 | 0.15 |
| 4576.0 | 0.15 |
| 4577.0 | 0.15 |
| 4578.0 | 0.15 |
| 4579.0 | 0.15 |
| 4580.0 | 0.15 |
| 4581.0 | 0.15 |
| 4582.0 | 0.15 |
| 4583.0 | 0.15 |
| 4584.0 | 0.15 |
| 4585.0 | 0.15 |
| 4586.0 | 0.15 |
| 4587.0 | 0.15 |
| 4588.0 | 0.15 |
| 4589.0 | 0.15 |
| 4590.0 | 0.15 |
| 4591.0 | 0.15 |
| 4592.0 | 0.15 |
| 4593.0 | 0.15 |
| 4594.0 | 0.15 |
| 4595.0 | 0.15 |
| 4596.0 | 0.15 |
| 4597.0 | 0.149 |
| 4598.0 | 0.15 |
| 4599.0 | 0.149 |
| 4600.0 | 0.149 |
| 4601.0 | 0.149 |
| 4602.0 | 0.149 |
| 4603.0 | 0.149 |
| 4604.0 | 0.149 |
| 4605.0 | 0.148 |
| 4606.0 | 0.148 |
| 4607.0 | 0.148 |
| 4608.0 | 0.148 |
| 4609.0 | 0.148 |
| 4610.0 | 0.148 |
| 4611.0 | 0.148 |
| 4612.0 | 0.148 |
| 4613.0 | 0.148 |
| 4614.0 | 0.148 |
| 4615.0 | 0.149 |
| 4616.0 | 0.149 |
| 4617.0 | 0.149 |
| 4618.0 | 0.149 |
| 4619.0 | 0.149 |
| 4620.0 | 0.149 |
| 4621.0 | 0.149 |
| 4622.0 | 0.149 |
| 4623.0 | 0.149 |
| 4624.0 | 0.149 |
| 4625.0 | 0.149 |
| 4626.0 | 0.149 |
| 4627.0 | 0.149 |
| 4628.0 | 0.149 |
| 4629.0 | 0.149 |
| 4630.0 | 0.148 |
| 4631.0 | 0.149 |
| 4632.0 | 0.149 |
| 4633.0 | 0.149 |
| 4634.0 | 0.149 |
| 4635.0 | 0.149 |
| 4636.0 | 0.149 |
| 4637.0 | 0.149 |
| 4638.0 | 0.15 |
| 4639.0 | 0.15 |
| 4640.0 | 0.149 |
| 4641.0 | 0.149 |
| 4642.0 | 0.15 |
| 4643.0 | 0.15 |
| 4644.0 | 0.149 |
| 4645.0 | 0.149 |
| 4646.0 | 0.15 |
| 4647.0 | 0.15 |
| 4648.0 | 0.15 |
| 4649.0 | 0.149 |
| 4650.0 | 0.15 |
| 4651.0 | 0.149 |
| 4652.0 | 0.15 |
| 4653.0 | 0.15 |
| 4654.0 | 0.149 |
| 4655.0 | 0.149 |
| 4656.0 | 0.149 |
| 4657.0 | 0.149 |
| 4658.0 | 0.149 |
| 4659.0 | 0.15 |
| 4660.0 | 0.149 |
| 4661.0 | 0.15 |
| 4662.0 | 0.149 |
| 4663.0 | 0.149 |
| 4664.0 | 0.15 |
| 4665.0 | 0.149 |
| 4666.0 | 0.149 |
| 4667.0 | 0.149 |
| 4668.0 | 0.149 |
| 4669.0 | 0.15 |
| 4670.0 | 0.147 |
| 4671.0 | 0.147 |
| 4672.0 | 0.147 |
| 4673.0 | 0.148 |
| 4674.0 | 0.148 |
| 4675.0 | 0.148 |
| 4676.0 | 0.148 |
| 4677.0 | 0.148 |
| 4678.0 | 0.148 |
| 4679.0 | 0.148 |
| 4680.0 | 0.147 |
| 4681.0 | 0.148 |
| 4682.0 | 0.146 |
| 4683.0 | 0.144 |
| 4684.0 | 0.147 |
| 4685.0 | 0.148 |
| 4686.0 | 0.148 |
| 4687.0 | 0.147 |
| 4688.0 | 0.147 |
| 4689.0 | 0.147 |
| 4690.0 | 0.146 |
| 4691.0 | 0.146 |
| 4692.0 | 0.145 |
| 4693.0 | 0.145 |
| 4694.0 | 0.146 |
| 4695.0 | 0.146 |
| 4696.0 | 0.145 |
| 4697.0 | 0.146 |
| 4698.0 | 0.144 |
| 4699.0 | 0.144 |
| 4700.0 | 0.144 |
| 4701.0 | 0.143 |
| 4702.0 | 0.141 |
| 4703.0 | 0.141 |
| 4704.0 | 0.141 |
| 4705.0 | 0.14 |
| 4706.0 | 0.139 |
| 4707.0 | 0.139 |
| 4708.0 | 0.139 |
| 4709.0 | 0.139 |
| 4710.0 | 0.141 |
| 4711.0 | 0.141 |
| 4712.0 | 0.141 |
| 4713.0 | 0.141 |
| 4714.0 | 0.142 |
| 4715.0 | 0.142 |
| 4716.0 | 0.141 |
| 4717.0 | 0.143 |
| 4718.0 | 0.147 |
| 4719.0 | 0.146 |
| 4720.0 | 0.147 |
| 4721.0 | 0.143 |
| 4722.0 | 0.143 |
| 4723.0 | 0.144 |
| 4724.0 | 0.145 |
| 4725.0 | 0.144 |
| 4726.0 | 0.144 |
| 4727.0 | 0.143 |
| 4728.0 | 0.143 |
| 4729.0 | 0.143 |
| 4730.0 | 0.143 |
| 4731.0 | 0.143 |
| 4732.0 | 0.143 |
| 4733.0 | 0.143 |
| 4734.0 | 0.143 |
| 4735.0 | 0.143 |
| 4736.0 | 0.143 |
| 4737.0 | 0.143 |
| 4738.0 | 0.144 |
| 4739.0 | 0.145 |
| 4740.0 | 0.145 |
| 4741.0 | 0.145 |
| 4742.0 | 0.145 |
| 4743.0 | 0.145 |
| 4744.0 | 0.145 |
| 4745.0 | 0.146 |
| 4746.0 | 0.146 |
| 4747.0 | 0.146 |
| 4748.0 | 0.146 |
| 4749.0 | 0.146 |
| 4750.0 | 0.146 |
| 4751.0 | 0.146 |
| 4752.0 | 0.146 |
| 4753.0 | 0.146 |
| 4754.0 | 0.146 |
| 4755.0 | 0.146 |
| 4756.0 | 0.146 |
| 4757.0 | 0.146 |
| 4758.0 | 0.146 |
| 4759.0 | 0.146 |
| 4760.0 | 0.146 |
| 4761.0 | 0.146 |
| 4762.0 | 0.146 |
| 4763.0 | 0.146 |
| 4764.0 | 0.146 |
| 4765.0 | 0.146 |
| 4766.0 | 0.146 |
| 4767.0 | 0.146 |
| 4768.0 | 0.146 |
| 4769.0 | 0.146 |
| 4770.0 | 0.146 |
| 4771.0 | 0.146 |
| 4772.0 | 0.146 |
| 4773.0 | 0.146 |
| 4774.0 | 0.146 |
| 4775.0 | 0.146 |
| 4776.0 | 0.146 |
| 4777.0 | 0.146 |
| 4778.0 | 0.146 |
| 4779.0 | 0.146 |
| 4780.0 | 0.146 |
| 4781.0 | 0.146 |
| 4782.0 | 0.146 |
| 4783.0 | 0.146 |
| 4784.0 | 0.146 |
| 4785.0 | 0.146 |
| 4786.0 | 0.146 |
| 4787.0 | 0.146 |
| 4788.0 | 0.144 |
| 4789.0 | 0.14 |
| 4790.0 | 0.148 |
| 4791.0 | 0.147 |
| 4792.0 | 0.146 |
| 4793.0 | 0.146 |
| 4794.0 | 0.145 |
| 4795.0 | 0.144 |
| 4796.0 | 0.145 |
| 4797.0 | 0.146 |
| 4798.0 | 0.147 |
| 4799.0 | 0.147 |
| 4800.0 | 0.146 |
| 4801.0 | 0.147 |
| 4802.0 | 0.148 |
| 4803.0 | 0.148 |
| 4804.0 | 0.148 |
| 4805.0 | 0.148 |
| 4806.0 | 0.148 |
| 4807.0 | 0.147 |
| 4808.0 | 0.147 |
| 4809.0 | 0.147 |
| 4810.0 | 0.147 |
| 4811.0 | 0.147 |
| 4812.0 | 0.147 |
| 4813.0 | 0.147 |
| 4814.0 | 0.147 |
| 4815.0 | 0.147 |
| 4816.0 | 0.146 |
| 4817.0 | 0.146 |
| 4818.0 | 0.146 |
| 4819.0 | 0.147 |
| 4820.0 | 0.148 |
| 4821.0 | 0.148 |
| 4822.0 | 0.146 |
| 4823.0 | 0.146 |
| 4824.0 | 0.146 |
| 4825.0 | 0.146 |
| 4826.0 | 0.146 |
| 4827.0 | 0.146 |
| 4828.0 | 0.147 |
| 4829.0 | 0.148 |
| 4830.0 | 0.147 |
| 4831.0 | 0.146 |
| 4832.0 | 0.147 |
| 4833.0 | 0.147 |
| 4834.0 | 0.147 |
| 4835.0 | 0.147 |
| 4836.0 | 0.146 |
| 4837.0 | 0.146 |
| 4838.0 | 0.146 |
| 4839.0 | 0.146 |
| 4840.0 | 0.146 |
| 4841.0 | 0.146 |
| 4842.0 | 0.146 |
| 4843.0 | 0.147 |
| 4844.0 | 0.147 |
| 4845.0 | 0.147 |
| 4846.0 | 0.147 |
| 4847.0 | 0.147 |
| 4848.0 | 0.147 |
| 4849.0 | 0.146 |
| 4850.0 | 0.146 |
| 4851.0 | 0.146 |
| 4852.0 | 0.146 |
| 4853.0 | 0.146 |
| 4854.0 | 0.146 |
| 4855.0 | 0.146 |
| 4856.0 | 0.146 |
| 4857.0 | 0.146 |
| 4858.0 | 0.146 |
| 4859.0 | 0.146 |
| 4860.0 | 0.146 |
| 4861.0 | 0.146 |
| 4862.0 | 0.146 |
| 4863.0 | 0.146 |
| 4864.0 | 0.146 |
| 4865.0 | 0.148 |
| 4866.0 | 0.148 |
| 4867.0 | 0.148 |
| 4868.0 | 0.147 |
| 4869.0 | 0.142 |
| 4870.0 | 0.14 |
| 4871.0 | 0.139 |
| 4872.0 | 0.139 |
| 4873.0 | 0.14 |
| 4874.0 | 0.14 |
| 4875.0 | 0.139 |
| 4876.0 | 0.139 |
| 4877.0 | 0.138 |
| 4878.0 | 0.136 |
| 4879.0 | 0.14 |
| 4880.0 | 0.147 |
| 4881.0 | 0.147 |
| 4882.0 | 0.147 |
| 4883.0 | 0.146 |
| 4884.0 | 0.151 |
| 4885.0 | 0.151 |
| 4886.0 | 0.151 |
| 4887.0 | 0.151 |
| 4888.0 | 0.151 |
| 4889.0 | 0.152 |
| 4890.0 | 0.152 |
| 4891.0 | 0.152 |
| 4892.0 | 0.152 |
| 4893.0 | 0.151 |
| 4894.0 | 0.151 |
| 4895.0 | 0.151 |
| 4896.0 | 0.151 |
| 4897.0 | 0.151 |
| 4898.0 | 0.151 |
| 4899.0 | 0.151 |
| 4900.0 | 0.151 |
| 4901.0 | 0.151 |
| 4902.0 | 0.151 |
| 4903.0 | 0.151 |
| 4904.0 | 0.151 |
| 4905.0 | 0.151 |
| 4906.0 | 0.152 |
| 4907.0 | 0.152 |
| 4908.0 | 0.152 |
| 4909.0 | 0.152 |
| 4910.0 | 0.152 |
| 4911.0 | 0.152 |
| 4912.0 | 0.152 |
| 4913.0 | 0.152 |
| 4914.0 | 0.151 |
| 4915.0 | 0.147 |
| 4916.0 | 0.145 |
| 4917.0 | 0.143 |
| 4918.0 | 0.142 |
| 4919.0 | 0.142 |
| 4920.0 | 0.142 |
| 4921.0 | 0.142 |
| 4922.0 | 0.142 |
| 4923.0 | 0.143 |
| 4924.0 | 0.166 |
| 4925.0 | 0.167 |
| 4926.0 | 0.167 |
| 4927.0 | 0.167 |
| 4928.0 | 0.167 |
| 4929.0 | 0.167 |
| 4930.0 | 0.168 |
| 4931.0 | 0.168 |
| 4932.0 | 0.168 |
| 4933.0 | 0.168 |
| 4934.0 | 0.168 |
| 4935.0 | 0.169 |
| 4936.0 | 0.169 |
| 4937.0 | 0.169 |
| 4938.0 | 0.169 |
| 4939.0 | 0.169 |
| 4940.0 | 0.169 |
| 4941.0 | 0.17 |
| 4942.0 | 0.17 |
| 4943.0 | 0.17 |
| 4944.0 | 0.17 |
| 4945.0 | 0.17 |
| 4946.0 | 0.17 |
| 4947.0 | 0.176 |
| 4948.0 | 0.176 |
| 4949.0 | 0.176 |
| 4950.0 | 0.176 |
| 4951.0 | 0.176 |
| 4952.0 | 0.176 |
| 4953.0 | 0.176 |
| 4954.0 | 0.176 |
| 4955.0 | 0.176 |
| 4956.0 | 0.177 |
| 4957.0 | 0.177 |
| 4958.0 | 0.177 |
| 4959.0 | 0.177 |
| 4960.0 | 0.177 |
| 4961.0 | 0.177 |
| 4962.0 | 0.177 |
| 4963.0 | 0.177 |
| 4964.0 | 0.177 |
| 4965.0 | 0.177 |
| 4966.0 | 0.177 |
| 4967.0 | 0.177 |
| 4968.0 | 0.177 |
| 4969.0 | 0.177 |
| 4970.0 | 0.149 |
| 4971.0 | 0.149 |
| 4972.0 | 0.149 |
| 4973.0 | 0.149 |
| 4974.0 | 0.147 |
| 4975.0 | 0.147 |
| 4976.0 | 0.147 |
| 4977.0 | 0.147 |
| 4978.0 | 0.147 |
| 4979.0 | 0.147 |
| 4980.0 | 0.147 |
| 4981.0 | 0.147 |
| 4982.0 | 0.146 |
| 4983.0 | 0.149 |
| 4984.0 | 0.149 |
| 4985.0 | 0.149 |
| 4986.0 | 0.149 |
| 4987.0 | 0.149 |
| 4988.0 | 0.149 |
| 4989.0 | 0.148 |
| 4990.0 | 0.148 |
| 4991.0 | 0.148 |
| 4992.0 | 0.149 |
| 4993.0 | 0.149 |
| 4994.0 | 0.02 |
| 4995.0 | 0.019 |
| 4996.0 | 0.016 |
| 4997.0 | 0.024 |
| 4998.0 | 0.023 |
| 4999.0 | 0.027 |
| 5000.0 | 0.023 |
| 5001.0 | 0.029 |
| 5002.0 | 0.044 |
| 5003.0 | 0.04 |
| 5004.0 | 0.051 |
| 5005.0 | 0.046 |
| 5006.0 | 0.056 |
| 5007.0 | 0.049 |
| 5008.0 | 0.054 |
| 5009.0 | 0.055 |
| 5010.0 | 0.032 |
| 5011.0 | 0.03 |
| 5012.0 | 0.027 |
| 5013.0 | 0.026 |
| 5014.0 | 0.028 |
| 5015.0 | 0.017 |
| 5016.0 | 0.014 |
| 5017.0 | 0.01 |
| 5018.0 | 0.01 |
| 5019.0 | 0.01 |
| 5020.0 | 0.012 |
| 5021.0 | 0.016 |
| 5022.0 | 0.031 |
| 5023.0 | 0.04 |
| 5024.0 | 0.035 |
| 5025.0 | 0.044 |
| 5026.0 | 0.056 |
| 5027.0 | 0.076 |
| 5028.0 | 0.081 |
| 5029.0 | 0.062 |
| 5030.0 | 0.052 |
| 5031.0 | 0.055 |
| 5032.0 | 0.064 |
| 5033.0 | 0.073 |
| 5034.0 | 0.082 |
| 5035.0 | 0.093 |
| 5036.0 | 0.109 |
| 5037.0 | 0.135 |
| 5038.0 | 0.133 |
| 5039.0 | 0.126 |
| 5040.0 | 0.13 |
| 5041.0 | 0.136 |
| 5042.0 | 0.136 |
| 5043.0 | 0.136 |
| 5044.0 | 0.136 |
| 5045.0 | 0.134 |
| 5046.0 | 0.135 |
| 5047.0 | 0.135 |
| 5048.0 | 0.135 |
| 5049.0 | 0.136 |
| 5050.0 | 0.136 |
| 5051.0 | 0.136 |
| 5052.0 | 0.136 |
| 5053.0 | 0.136 |
| 5054.0 | 0.135 |
| 5055.0 | 0.135 |
| 5056.0 | 0.135 |
| 5057.0 | 0.135 |
| 5058.0 | 0.135 |
| 5059.0 | 0.135 |
| 5060.0 | 0.135 |
| 5061.0 | 0.135 |
| 5062.0 | 0.135 |
| 5063.0 | 0.135 |
| 5064.0 | 0.135 |
| 5065.0 | 0.135 |
| 5066.0 | 0.135 |
| 5067.0 | 0.135 |
| 5068.0 | 0.135 |
| 5069.0 | 0.135 |
| 5070.0 | 0.135 |
| 5071.0 | 0.135 |
| 5072.0 | 0.135 |
| 5073.0 | 0.135 |
| 5074.0 | 0.135 |
| 5075.0 | 0.135 |
| 5076.0 | 0.135 |
| 5077.0 | 0.135 |
| 5078.0 | 0.135 |
| 5079.0 | 0.135 |
| 5080.0 | 0.135 |
| 5081.0 | 0.135 |
| 5082.0 | 0.135 |
| 5083.0 | 0.135 |
| 5084.0 | 0.135 |
| 5085.0 | 0.135 |
| 5086.0 | 0.135 |
| 5087.0 | 0.135 |
| 5088.0 | 0.135 |
| 5089.0 | 0.128 |
| 5090.0 | 0.133 |
| 5091.0 | 0.132 |
| 5092.0 | 0.133 |
| 5093.0 | 0.132 |
| 5094.0 | 0.136 |
| 5095.0 | 0.145 |
| 5096.0 | 0.144 |
| 5097.0 | 0.144 |
| 5098.0 | 0.144 |
| 5099.0 | 0.144 |
| 5100.0 | 0.144 |
| 5101.0 | 0.144 |
| 5102.0 | 0.144 |
| 5103.0 | 0.144 |
| 5104.0 | 0.144 |
| 5105.0 | 0.143 |
| 5106.0 | 0.143 |
| 5107.0 | 0.143 |
| 5108.0 | 0.143 |
| 5109.0 | 0.152 |
| 5110.0 | 0.152 |
| 5111.0 | 0.152 |
| 5112.0 | 0.152 |
| 5113.0 | 0.152 |
| 5114.0 | 0.151 |
| 5115.0 | 0.151 |
| 5116.0 | 0.151 |
| 5117.0 | 0.151 |
| 5118.0 | 0.151 |
| 5119.0 | 0.151 |
| 5120.0 | 0.15 |
| 5121.0 | 0.15 |
| 5122.0 | 0.093 |
| 5123.0 | 0.093 |
| 5124.0 | 0.093 |
| 5125.0 | 0.093 |
| 5126.0 | 0.093 |
| 5127.0 | 0.093 |
| 5128.0 | 0.093 |
| 5129.0 | 0.093 |
| 5130.0 | 0.093 |
| 5131.0 | 0.092 |
| 5132.0 | 0.082 |
| 5133.0 | 0.082 |
| 5134.0 | 0.082 |
| 5135.0 | 0.082 |
| 5136.0 | 0.1 |
| 5137.0 | 0.123 |
| 5138.0 | 0.152 |
| 5139.0 | 0.151 |
| 5140.0 | 0.151 |
| 5141.0 | 0.15 |
| 5142.0 | 0.15 |
| 5143.0 | 0.15 |
| 5144.0 | 0.149 |
| 5145.0 | 0.148 |
| 5146.0 | 0.148 |
| 5147.0 | 0.148 |
| 5148.0 | 0.148 |
| 5149.0 | 0.148 |
| 5150.0 | 0.148 |
| 5151.0 | 0.148 |
| 5152.0 | 0.148 |
| 5153.0 | 0.147 |
| 5154.0 | 0.147 |
| 5155.0 | 0.147 |
| 5156.0 | 0.144 |
| 5157.0 | 0.152 |
| 5158.0 | 0.152 |
| 5159.0 | 0.152 |
| 5160.0 | 0.152 |
| 5161.0 | 0.152 |
| 5162.0 | 0.152 |
| 5163.0 | 0.152 |
| 5164.0 | 0.152 |
| 5165.0 | 0.151 |
| 5166.0 | 0.152 |
| 5167.0 | 0.152 |
| 5168.0 | 0.155 |
| 5169.0 | 0.154 |
| 5170.0 | 0.153 |
| 5171.0 | 0.153 |
| 5172.0 | 0.152 |
| 5173.0 | 0.152 |
| 5174.0 | 0.152 |
| 5175.0 | 0.152 |
| 5176.0 | 0.154 |
| 5177.0 | 0.155 |
| 5178.0 | 0.155 |
| 5179.0 | 0.154 |
| 5180.0 | 0.151 |
| 5181.0 | 0.151 |
| 5182.0 | 0.151 |
| 5183.0 | 0.15 |
| 5184.0 | 0.15 |
| 5185.0 | 0.155 |
| 5186.0 | 0.155 |
| 5187.0 | 0.154 |
| 5188.0 | 0.154 |
| 5189.0 | 0.154 |
| 5190.0 | 0.151 |
| 5191.0 | 0.105 |
| 5192.0 | 0.118 |
| 5193.0 | 0.111 |
| 5194.0 | 0.146 |
| 5195.0 | 0.149 |
| 5196.0 | 0.143 |
| 5197.0 | 0.147 |
| 5198.0 | 0.15 |
| 5199.0 | 0.156 |
| 5200.0 | 0.156 |
| 5201.0 | 0.156 |
| 5202.0 | 0.155 |
| 5203.0 | 0.155 |
| 5204.0 | 0.156 |
| 5205.0 | 0.156 |
| 5206.0 | 0.159 |
| 5207.0 | 0.159 |
| 5208.0 | 0.159 |
| 5209.0 | 0.159 |
| 5210.0 | 0.158 |
| 5211.0 | 0.158 |
| 5212.0 | 0.158 |
| 5213.0 | 0.158 |
| 5214.0 | 0.158 |
| 5215.0 | 0.158 |
| 5216.0 | 0.033 |
| 5217.0 | 0.033 |
| 5218.0 | 0.033 |
| 5219.0 | 0.033 |
| 5220.0 | 0.033 |
| 5221.0 | 0.033 |
| 5222.0 | 0.033 |
| 5223.0 | 0.033 |
| 5224.0 | 0.033 |
| 5225.0 | 0.033 |
| 5226.0 | 0.033 |
| 5227.0 | 0.033 |
| 5228.0 | 0.033 |
| 5229.0 | 0.033 |
| 5230.0 | 0.033 |
| 5231.0 | 0.033 |
| 5232.0 | 0.033 |
| 5233.0 | 0.033 |
| 5234.0 | 0.054 |
| 5235.0 | 0.033 |
| 5236.0 | 0.032 |
| 5237.0 | 0.032 |
| 5238.0 | 0.032 |
| 5239.0 | 0.032 |
| 5240.0 | 0.032 |
| 5241.0 | 0.032 |
| 5242.0 | 0.032 |
| 5243.0 | 0.032 |
| 5244.0 | 0.094 |
| 5245.0 | 0.135 |
| 5246.0 | 0.131 |
| 5247.0 | 0.128 |
| 5248.0 | 0.048 |
| 5249.0 | 0.032 |
| 5250.0 | 0.121 |
| 5251.0 | 0.121 |
| 5252.0 | 0.122 |
| 5253.0 | 0.122 |
| 5254.0 | 0.122 |
| 5255.0 | 0.122 |
| 5256.0 | 0.122 |
| 5257.0 | 0.123 |
| 5258.0 | 0.131 |
| 5259.0 | 0.131 |
| 5260.0 | 0.131 |
| 5261.0 | 0.131 |
| 5262.0 | 0.131 |
| 5263.0 | 0.131 |
| 5264.0 | 0.131 |
| 5265.0 | 0.131 |